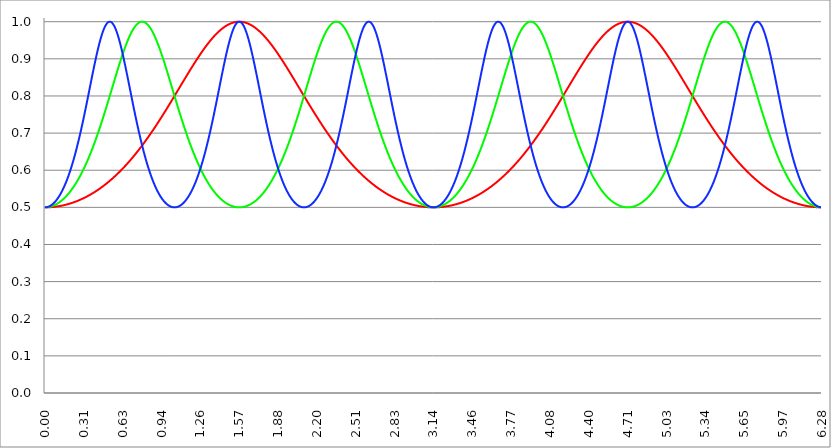
| Category | Series 1 | Series 0 | Series 2 |
|---|---|---|---|
| 0.0 | 0.5 | 0.5 | 0.5 |
| 0.00314159265358979 | 0.5 | 0.5 | 0.5 |
| 0.00628318530717958 | 0.5 | 0.5 | 0.5 |
| 0.00942477796076938 | 0.5 | 0.5 | 0.5 |
| 0.0125663706143592 | 0.5 | 0.5 | 0.5 |
| 0.015707963267949 | 0.5 | 0.5 | 0.501 |
| 0.0188495559215388 | 0.5 | 0.5 | 0.501 |
| 0.0219911485751285 | 0.5 | 0.5 | 0.501 |
| 0.0251327412287183 | 0.5 | 0.501 | 0.501 |
| 0.0282743338823081 | 0.5 | 0.501 | 0.502 |
| 0.0314159265358979 | 0.5 | 0.501 | 0.502 |
| 0.0345575191894877 | 0.5 | 0.501 | 0.503 |
| 0.0376991118430775 | 0.5 | 0.501 | 0.503 |
| 0.0408407044966673 | 0.5 | 0.502 | 0.504 |
| 0.0439822971502571 | 0.5 | 0.502 | 0.504 |
| 0.0471238898038469 | 0.501 | 0.502 | 0.505 |
| 0.0502654824574367 | 0.501 | 0.503 | 0.506 |
| 0.0534070751110265 | 0.501 | 0.503 | 0.506 |
| 0.0565486677646163 | 0.501 | 0.503 | 0.507 |
| 0.059690260418206 | 0.501 | 0.504 | 0.508 |
| 0.0628318530717958 | 0.501 | 0.504 | 0.509 |
| 0.0659734457253856 | 0.501 | 0.504 | 0.51 |
| 0.0691150383789754 | 0.501 | 0.505 | 0.511 |
| 0.0722566310325652 | 0.501 | 0.505 | 0.512 |
| 0.075398223686155 | 0.501 | 0.506 | 0.513 |
| 0.0785398163397448 | 0.502 | 0.506 | 0.514 |
| 0.0816814089933346 | 0.502 | 0.507 | 0.515 |
| 0.0848230016469244 | 0.502 | 0.507 | 0.516 |
| 0.0879645943005142 | 0.502 | 0.508 | 0.518 |
| 0.091106186954104 | 0.502 | 0.508 | 0.519 |
| 0.0942477796076937 | 0.502 | 0.509 | 0.52 |
| 0.0973893722612835 | 0.502 | 0.51 | 0.522 |
| 0.100530964914873 | 0.503 | 0.51 | 0.523 |
| 0.103672557568463 | 0.503 | 0.511 | 0.525 |
| 0.106814150222053 | 0.503 | 0.511 | 0.526 |
| 0.109955742875643 | 0.503 | 0.512 | 0.528 |
| 0.113097335529233 | 0.503 | 0.513 | 0.529 |
| 0.116238928182822 | 0.503 | 0.514 | 0.531 |
| 0.119380520836412 | 0.504 | 0.514 | 0.533 |
| 0.122522113490002 | 0.504 | 0.515 | 0.535 |
| 0.125663706143592 | 0.504 | 0.516 | 0.536 |
| 0.128805298797181 | 0.504 | 0.517 | 0.538 |
| 0.131946891450771 | 0.504 | 0.518 | 0.54 |
| 0.135088484104361 | 0.505 | 0.518 | 0.542 |
| 0.138230076757951 | 0.505 | 0.519 | 0.544 |
| 0.141371669411541 | 0.505 | 0.52 | 0.546 |
| 0.14451326206513 | 0.505 | 0.521 | 0.548 |
| 0.14765485471872 | 0.505 | 0.522 | 0.551 |
| 0.15079644737231 | 0.506 | 0.523 | 0.553 |
| 0.1539380400259 | 0.506 | 0.524 | 0.555 |
| 0.15707963267949 | 0.506 | 0.525 | 0.557 |
| 0.160221225333079 | 0.506 | 0.526 | 0.56 |
| 0.163362817986669 | 0.507 | 0.527 | 0.562 |
| 0.166504410640259 | 0.507 | 0.528 | 0.565 |
| 0.169646003293849 | 0.507 | 0.529 | 0.567 |
| 0.172787595947439 | 0.508 | 0.53 | 0.57 |
| 0.175929188601028 | 0.508 | 0.532 | 0.573 |
| 0.179070781254618 | 0.508 | 0.533 | 0.575 |
| 0.182212373908208 | 0.508 | 0.534 | 0.578 |
| 0.185353966561798 | 0.509 | 0.535 | 0.581 |
| 0.188495559215388 | 0.509 | 0.536 | 0.584 |
| 0.191637151868977 | 0.509 | 0.538 | 0.587 |
| 0.194778744522567 | 0.51 | 0.539 | 0.59 |
| 0.197920337176157 | 0.51 | 0.54 | 0.593 |
| 0.201061929829747 | 0.51 | 0.541 | 0.596 |
| 0.204203522483336 | 0.51 | 0.543 | 0.599 |
| 0.207345115136926 | 0.511 | 0.544 | 0.602 |
| 0.210486707790516 | 0.511 | 0.546 | 0.606 |
| 0.213628300444106 | 0.511 | 0.547 | 0.609 |
| 0.216769893097696 | 0.512 | 0.548 | 0.612 |
| 0.219911485751285 | 0.512 | 0.55 | 0.616 |
| 0.223053078404875 | 0.513 | 0.551 | 0.619 |
| 0.226194671058465 | 0.513 | 0.553 | 0.623 |
| 0.229336263712055 | 0.513 | 0.554 | 0.626 |
| 0.232477856365645 | 0.514 | 0.556 | 0.63 |
| 0.235619449019234 | 0.514 | 0.557 | 0.634 |
| 0.238761041672824 | 0.514 | 0.559 | 0.637 |
| 0.241902634326414 | 0.515 | 0.561 | 0.641 |
| 0.245044226980004 | 0.515 | 0.562 | 0.645 |
| 0.248185819633594 | 0.516 | 0.564 | 0.649 |
| 0.251327412287183 | 0.516 | 0.566 | 0.653 |
| 0.254469004940773 | 0.516 | 0.567 | 0.657 |
| 0.257610597594363 | 0.517 | 0.569 | 0.661 |
| 0.260752190247953 | 0.517 | 0.571 | 0.665 |
| 0.263893782901543 | 0.518 | 0.573 | 0.669 |
| 0.267035375555132 | 0.518 | 0.574 | 0.674 |
| 0.270176968208722 | 0.518 | 0.576 | 0.678 |
| 0.273318560862312 | 0.519 | 0.578 | 0.682 |
| 0.276460153515902 | 0.519 | 0.58 | 0.687 |
| 0.279601746169492 | 0.52 | 0.582 | 0.691 |
| 0.282743338823082 | 0.52 | 0.584 | 0.696 |
| 0.285884931476671 | 0.521 | 0.586 | 0.7 |
| 0.289026524130261 | 0.521 | 0.588 | 0.705 |
| 0.292168116783851 | 0.522 | 0.59 | 0.71 |
| 0.295309709437441 | 0.522 | 0.592 | 0.714 |
| 0.298451302091031 | 0.523 | 0.594 | 0.719 |
| 0.30159289474462 | 0.523 | 0.596 | 0.724 |
| 0.30473448739821 | 0.524 | 0.598 | 0.729 |
| 0.3078760800518 | 0.524 | 0.6 | 0.733 |
| 0.31101767270539 | 0.525 | 0.602 | 0.738 |
| 0.31415926535898 | 0.525 | 0.604 | 0.743 |
| 0.31730085801257 | 0.526 | 0.607 | 0.748 |
| 0.320442450666159 | 0.526 | 0.609 | 0.753 |
| 0.323584043319749 | 0.527 | 0.611 | 0.758 |
| 0.326725635973339 | 0.527 | 0.613 | 0.763 |
| 0.329867228626929 | 0.528 | 0.616 | 0.768 |
| 0.333008821280519 | 0.528 | 0.618 | 0.774 |
| 0.336150413934108 | 0.529 | 0.62 | 0.779 |
| 0.339292006587698 | 0.529 | 0.623 | 0.784 |
| 0.342433599241288 | 0.53 | 0.625 | 0.789 |
| 0.345575191894878 | 0.53 | 0.627 | 0.794 |
| 0.348716784548468 | 0.531 | 0.63 | 0.799 |
| 0.351858377202058 | 0.532 | 0.632 | 0.805 |
| 0.354999969855647 | 0.532 | 0.635 | 0.81 |
| 0.358141562509237 | 0.533 | 0.637 | 0.815 |
| 0.361283155162827 | 0.533 | 0.64 | 0.82 |
| 0.364424747816417 | 0.534 | 0.642 | 0.826 |
| 0.367566340470007 | 0.535 | 0.645 | 0.831 |
| 0.370707933123597 | 0.535 | 0.648 | 0.836 |
| 0.373849525777186 | 0.536 | 0.65 | 0.841 |
| 0.376991118430776 | 0.536 | 0.653 | 0.847 |
| 0.380132711084366 | 0.537 | 0.656 | 0.852 |
| 0.383274303737956 | 0.538 | 0.658 | 0.857 |
| 0.386415896391546 | 0.538 | 0.661 | 0.862 |
| 0.389557489045135 | 0.539 | 0.664 | 0.867 |
| 0.392699081698725 | 0.54 | 0.667 | 0.872 |
| 0.395840674352315 | 0.54 | 0.669 | 0.877 |
| 0.398982267005905 | 0.541 | 0.672 | 0.882 |
| 0.402123859659495 | 0.541 | 0.675 | 0.887 |
| 0.405265452313085 | 0.542 | 0.678 | 0.892 |
| 0.408407044966674 | 0.543 | 0.681 | 0.897 |
| 0.411548637620264 | 0.543 | 0.684 | 0.902 |
| 0.414690230273854 | 0.544 | 0.687 | 0.907 |
| 0.417831822927444 | 0.545 | 0.69 | 0.911 |
| 0.420973415581034 | 0.546 | 0.693 | 0.916 |
| 0.424115008234623 | 0.546 | 0.696 | 0.92 |
| 0.427256600888213 | 0.547 | 0.699 | 0.925 |
| 0.430398193541803 | 0.548 | 0.702 | 0.929 |
| 0.433539786195393 | 0.548 | 0.705 | 0.934 |
| 0.436681378848983 | 0.549 | 0.708 | 0.938 |
| 0.439822971502573 | 0.55 | 0.711 | 0.942 |
| 0.442964564156162 | 0.551 | 0.714 | 0.946 |
| 0.446106156809752 | 0.551 | 0.717 | 0.95 |
| 0.449247749463342 | 0.552 | 0.721 | 0.953 |
| 0.452389342116932 | 0.553 | 0.724 | 0.957 |
| 0.455530934770522 | 0.554 | 0.727 | 0.961 |
| 0.458672527424111 | 0.554 | 0.73 | 0.964 |
| 0.461814120077701 | 0.555 | 0.733 | 0.967 |
| 0.464955712731291 | 0.556 | 0.737 | 0.97 |
| 0.468097305384881 | 0.557 | 0.74 | 0.973 |
| 0.471238898038471 | 0.557 | 0.743 | 0.976 |
| 0.474380490692061 | 0.558 | 0.747 | 0.979 |
| 0.47752208334565 | 0.559 | 0.75 | 0.981 |
| 0.48066367599924 | 0.56 | 0.753 | 0.984 |
| 0.48380526865283 | 0.561 | 0.757 | 0.986 |
| 0.48694686130642 | 0.561 | 0.76 | 0.988 |
| 0.49008845396001 | 0.562 | 0.763 | 0.99 |
| 0.493230046613599 | 0.563 | 0.767 | 0.992 |
| 0.496371639267189 | 0.564 | 0.77 | 0.993 |
| 0.499513231920779 | 0.565 | 0.774 | 0.995 |
| 0.502654824574369 | 0.566 | 0.777 | 0.996 |
| 0.505796417227959 | 0.566 | 0.78 | 0.997 |
| 0.508938009881549 | 0.567 | 0.784 | 0.998 |
| 0.512079602535138 | 0.568 | 0.787 | 0.999 |
| 0.515221195188728 | 0.569 | 0.791 | 0.999 |
| 0.518362787842318 | 0.57 | 0.794 | 1 |
| 0.521504380495908 | 0.571 | 0.798 | 1 |
| 0.524645973149498 | 0.572 | 0.801 | 1 |
| 0.527787565803087 | 0.573 | 0.805 | 1 |
| 0.530929158456677 | 0.574 | 0.808 | 1 |
| 0.534070751110267 | 0.574 | 0.812 | 0.999 |
| 0.537212343763857 | 0.575 | 0.815 | 0.998 |
| 0.540353936417447 | 0.576 | 0.819 | 0.997 |
| 0.543495529071037 | 0.577 | 0.822 | 0.996 |
| 0.546637121724626 | 0.578 | 0.826 | 0.995 |
| 0.549778714378216 | 0.579 | 0.829 | 0.994 |
| 0.552920307031806 | 0.58 | 0.833 | 0.992 |
| 0.556061899685396 | 0.581 | 0.836 | 0.991 |
| 0.559203492338986 | 0.582 | 0.84 | 0.989 |
| 0.562345084992576 | 0.583 | 0.843 | 0.987 |
| 0.565486677646165 | 0.584 | 0.847 | 0.985 |
| 0.568628270299755 | 0.585 | 0.85 | 0.982 |
| 0.571769862953345 | 0.586 | 0.853 | 0.98 |
| 0.574911455606935 | 0.587 | 0.857 | 0.977 |
| 0.578053048260525 | 0.588 | 0.86 | 0.974 |
| 0.581194640914114 | 0.589 | 0.864 | 0.971 |
| 0.584336233567704 | 0.59 | 0.867 | 0.968 |
| 0.587477826221294 | 0.591 | 0.871 | 0.965 |
| 0.590619418874884 | 0.592 | 0.874 | 0.962 |
| 0.593761011528474 | 0.593 | 0.877 | 0.958 |
| 0.596902604182064 | 0.594 | 0.881 | 0.955 |
| 0.600044196835653 | 0.595 | 0.884 | 0.951 |
| 0.603185789489243 | 0.596 | 0.887 | 0.947 |
| 0.606327382142833 | 0.597 | 0.891 | 0.943 |
| 0.609468974796423 | 0.598 | 0.894 | 0.939 |
| 0.612610567450013 | 0.599 | 0.897 | 0.935 |
| 0.615752160103602 | 0.6 | 0.9 | 0.931 |
| 0.618893752757192 | 0.601 | 0.903 | 0.926 |
| 0.622035345410782 | 0.602 | 0.907 | 0.922 |
| 0.625176938064372 | 0.603 | 0.91 | 0.917 |
| 0.628318530717962 | 0.604 | 0.913 | 0.913 |
| 0.631460123371551 | 0.606 | 0.916 | 0.908 |
| 0.634601716025141 | 0.607 | 0.919 | 0.903 |
| 0.637743308678731 | 0.608 | 0.922 | 0.899 |
| 0.640884901332321 | 0.609 | 0.925 | 0.894 |
| 0.644026493985911 | 0.61 | 0.928 | 0.889 |
| 0.647168086639501 | 0.611 | 0.931 | 0.884 |
| 0.65030967929309 | 0.612 | 0.934 | 0.879 |
| 0.65345127194668 | 0.613 | 0.936 | 0.874 |
| 0.65659286460027 | 0.614 | 0.939 | 0.869 |
| 0.65973445725386 | 0.616 | 0.942 | 0.864 |
| 0.66287604990745 | 0.617 | 0.944 | 0.859 |
| 0.666017642561039 | 0.618 | 0.947 | 0.853 |
| 0.669159235214629 | 0.619 | 0.95 | 0.848 |
| 0.672300827868219 | 0.62 | 0.952 | 0.843 |
| 0.675442420521809 | 0.621 | 0.955 | 0.838 |
| 0.678584013175399 | 0.623 | 0.957 | 0.833 |
| 0.681725605828989 | 0.624 | 0.959 | 0.827 |
| 0.684867198482578 | 0.625 | 0.962 | 0.822 |
| 0.688008791136168 | 0.626 | 0.964 | 0.817 |
| 0.691150383789758 | 0.627 | 0.966 | 0.812 |
| 0.694291976443348 | 0.629 | 0.968 | 0.806 |
| 0.697433569096938 | 0.63 | 0.97 | 0.801 |
| 0.700575161750528 | 0.631 | 0.972 | 0.796 |
| 0.703716754404117 | 0.632 | 0.974 | 0.791 |
| 0.706858347057707 | 0.634 | 0.976 | 0.786 |
| 0.709999939711297 | 0.635 | 0.978 | 0.78 |
| 0.713141532364887 | 0.636 | 0.98 | 0.775 |
| 0.716283125018477 | 0.637 | 0.981 | 0.77 |
| 0.719424717672066 | 0.639 | 0.983 | 0.765 |
| 0.722566310325656 | 0.64 | 0.985 | 0.76 |
| 0.725707902979246 | 0.641 | 0.986 | 0.755 |
| 0.728849495632836 | 0.642 | 0.987 | 0.75 |
| 0.731991088286426 | 0.644 | 0.989 | 0.745 |
| 0.735132680940016 | 0.645 | 0.99 | 0.74 |
| 0.738274273593605 | 0.646 | 0.991 | 0.735 |
| 0.741415866247195 | 0.648 | 0.992 | 0.73 |
| 0.744557458900785 | 0.649 | 0.993 | 0.725 |
| 0.747699051554375 | 0.65 | 0.994 | 0.721 |
| 0.750840644207965 | 0.652 | 0.995 | 0.716 |
| 0.753982236861554 | 0.653 | 0.996 | 0.711 |
| 0.757123829515144 | 0.654 | 0.997 | 0.706 |
| 0.760265422168734 | 0.656 | 0.997 | 0.702 |
| 0.763407014822324 | 0.657 | 0.998 | 0.697 |
| 0.766548607475914 | 0.658 | 0.999 | 0.693 |
| 0.769690200129504 | 0.66 | 0.999 | 0.688 |
| 0.772831792783093 | 0.661 | 0.999 | 0.684 |
| 0.775973385436683 | 0.663 | 1 | 0.679 |
| 0.779114978090273 | 0.664 | 1 | 0.675 |
| 0.782256570743863 | 0.665 | 1 | 0.671 |
| 0.785398163397453 | 0.667 | 1 | 0.667 |
| 0.788539756051042 | 0.668 | 1 | 0.663 |
| 0.791681348704632 | 0.669 | 1 | 0.658 |
| 0.794822941358222 | 0.671 | 1 | 0.654 |
| 0.797964534011812 | 0.672 | 0.999 | 0.65 |
| 0.801106126665402 | 0.674 | 0.999 | 0.646 |
| 0.804247719318992 | 0.675 | 0.999 | 0.642 |
| 0.807389311972581 | 0.677 | 0.998 | 0.639 |
| 0.810530904626171 | 0.678 | 0.997 | 0.635 |
| 0.813672497279761 | 0.679 | 0.997 | 0.631 |
| 0.816814089933351 | 0.681 | 0.996 | 0.627 |
| 0.819955682586941 | 0.682 | 0.995 | 0.624 |
| 0.823097275240531 | 0.684 | 0.994 | 0.62 |
| 0.82623886789412 | 0.685 | 0.993 | 0.617 |
| 0.82938046054771 | 0.687 | 0.992 | 0.613 |
| 0.8325220532013 | 0.688 | 0.991 | 0.61 |
| 0.83566364585489 | 0.69 | 0.99 | 0.607 |
| 0.83880523850848 | 0.691 | 0.989 | 0.603 |
| 0.841946831162069 | 0.693 | 0.987 | 0.6 |
| 0.845088423815659 | 0.694 | 0.986 | 0.597 |
| 0.848230016469249 | 0.696 | 0.985 | 0.594 |
| 0.851371609122839 | 0.697 | 0.983 | 0.591 |
| 0.854513201776429 | 0.699 | 0.981 | 0.588 |
| 0.857654794430019 | 0.7 | 0.98 | 0.585 |
| 0.860796387083608 | 0.702 | 0.978 | 0.582 |
| 0.863937979737198 | 0.703 | 0.976 | 0.579 |
| 0.867079572390788 | 0.705 | 0.974 | 0.576 |
| 0.870221165044378 | 0.706 | 0.972 | 0.574 |
| 0.873362757697968 | 0.708 | 0.97 | 0.571 |
| 0.876504350351557 | 0.71 | 0.968 | 0.568 |
| 0.879645943005147 | 0.711 | 0.966 | 0.566 |
| 0.882787535658737 | 0.713 | 0.964 | 0.563 |
| 0.885929128312327 | 0.714 | 0.962 | 0.561 |
| 0.889070720965917 | 0.716 | 0.959 | 0.558 |
| 0.892212313619507 | 0.717 | 0.957 | 0.556 |
| 0.895353906273096 | 0.719 | 0.955 | 0.554 |
| 0.898495498926686 | 0.721 | 0.952 | 0.551 |
| 0.901637091580276 | 0.722 | 0.95 | 0.549 |
| 0.904778684233866 | 0.724 | 0.947 | 0.547 |
| 0.907920276887456 | 0.725 | 0.944 | 0.545 |
| 0.911061869541045 | 0.727 | 0.942 | 0.543 |
| 0.914203462194635 | 0.729 | 0.939 | 0.541 |
| 0.917345054848225 | 0.73 | 0.936 | 0.539 |
| 0.920486647501815 | 0.732 | 0.934 | 0.537 |
| 0.923628240155405 | 0.733 | 0.931 | 0.535 |
| 0.926769832808995 | 0.735 | 0.928 | 0.533 |
| 0.929911425462584 | 0.737 | 0.925 | 0.532 |
| 0.933053018116174 | 0.738 | 0.922 | 0.53 |
| 0.936194610769764 | 0.74 | 0.919 | 0.528 |
| 0.939336203423354 | 0.742 | 0.916 | 0.527 |
| 0.942477796076944 | 0.743 | 0.913 | 0.525 |
| 0.945619388730533 | 0.745 | 0.91 | 0.524 |
| 0.948760981384123 | 0.747 | 0.907 | 0.522 |
| 0.951902574037713 | 0.748 | 0.903 | 0.521 |
| 0.955044166691303 | 0.75 | 0.9 | 0.519 |
| 0.958185759344893 | 0.752 | 0.897 | 0.518 |
| 0.961327351998483 | 0.753 | 0.894 | 0.517 |
| 0.964468944652072 | 0.755 | 0.891 | 0.516 |
| 0.967610537305662 | 0.757 | 0.887 | 0.514 |
| 0.970752129959252 | 0.758 | 0.884 | 0.513 |
| 0.973893722612842 | 0.76 | 0.881 | 0.512 |
| 0.977035315266432 | 0.762 | 0.877 | 0.511 |
| 0.980176907920022 | 0.763 | 0.874 | 0.51 |
| 0.983318500573611 | 0.765 | 0.871 | 0.509 |
| 0.986460093227201 | 0.767 | 0.867 | 0.508 |
| 0.989601685880791 | 0.768 | 0.864 | 0.508 |
| 0.992743278534381 | 0.77 | 0.86 | 0.507 |
| 0.995884871187971 | 0.772 | 0.857 | 0.506 |
| 0.99902646384156 | 0.774 | 0.853 | 0.505 |
| 1.00216805649515 | 0.775 | 0.85 | 0.505 |
| 1.00530964914874 | 0.777 | 0.847 | 0.504 |
| 1.00845124180233 | 0.779 | 0.843 | 0.503 |
| 1.01159283445592 | 0.78 | 0.84 | 0.503 |
| 1.01473442710951 | 0.782 | 0.836 | 0.502 |
| 1.017876019763099 | 0.784 | 0.833 | 0.502 |
| 1.021017612416689 | 0.786 | 0.829 | 0.502 |
| 1.02415920507028 | 0.787 | 0.826 | 0.501 |
| 1.027300797723869 | 0.789 | 0.822 | 0.501 |
| 1.030442390377459 | 0.791 | 0.819 | 0.501 |
| 1.033583983031048 | 0.792 | 0.815 | 0.5 |
| 1.036725575684638 | 0.794 | 0.812 | 0.5 |
| 1.039867168338228 | 0.796 | 0.808 | 0.5 |
| 1.043008760991818 | 0.798 | 0.805 | 0.5 |
| 1.046150353645408 | 0.799 | 0.801 | 0.5 |
| 1.049291946298998 | 0.801 | 0.798 | 0.5 |
| 1.052433538952587 | 0.803 | 0.794 | 0.5 |
| 1.055575131606177 | 0.805 | 0.791 | 0.5 |
| 1.058716724259767 | 0.806 | 0.787 | 0.5 |
| 1.061858316913357 | 0.808 | 0.784 | 0.5 |
| 1.064999909566947 | 0.81 | 0.78 | 0.501 |
| 1.068141502220536 | 0.812 | 0.777 | 0.501 |
| 1.071283094874126 | 0.813 | 0.774 | 0.501 |
| 1.074424687527716 | 0.815 | 0.77 | 0.502 |
| 1.077566280181306 | 0.817 | 0.767 | 0.502 |
| 1.080707872834896 | 0.819 | 0.763 | 0.503 |
| 1.083849465488486 | 0.82 | 0.76 | 0.503 |
| 1.086991058142075 | 0.822 | 0.757 | 0.504 |
| 1.090132650795665 | 0.824 | 0.753 | 0.504 |
| 1.093274243449255 | 0.826 | 0.75 | 0.505 |
| 1.096415836102845 | 0.827 | 0.747 | 0.505 |
| 1.099557428756435 | 0.829 | 0.743 | 0.506 |
| 1.102699021410025 | 0.831 | 0.74 | 0.507 |
| 1.105840614063614 | 0.833 | 0.737 | 0.508 |
| 1.108982206717204 | 0.834 | 0.733 | 0.509 |
| 1.112123799370794 | 0.836 | 0.73 | 0.51 |
| 1.115265392024384 | 0.838 | 0.727 | 0.51 |
| 1.118406984677974 | 0.84 | 0.724 | 0.511 |
| 1.121548577331563 | 0.841 | 0.721 | 0.513 |
| 1.124690169985153 | 0.843 | 0.717 | 0.514 |
| 1.127831762638743 | 0.845 | 0.714 | 0.515 |
| 1.130973355292333 | 0.847 | 0.711 | 0.516 |
| 1.134114947945923 | 0.848 | 0.708 | 0.517 |
| 1.137256540599513 | 0.85 | 0.705 | 0.518 |
| 1.140398133253102 | 0.852 | 0.702 | 0.52 |
| 1.143539725906692 | 0.853 | 0.699 | 0.521 |
| 1.146681318560282 | 0.855 | 0.696 | 0.523 |
| 1.149822911213872 | 0.857 | 0.693 | 0.524 |
| 1.152964503867462 | 0.859 | 0.69 | 0.526 |
| 1.156106096521051 | 0.86 | 0.687 | 0.527 |
| 1.159247689174641 | 0.862 | 0.684 | 0.529 |
| 1.162389281828231 | 0.864 | 0.681 | 0.53 |
| 1.165530874481821 | 0.865 | 0.678 | 0.532 |
| 1.168672467135411 | 0.867 | 0.675 | 0.534 |
| 1.171814059789001 | 0.869 | 0.672 | 0.536 |
| 1.17495565244259 | 0.871 | 0.669 | 0.538 |
| 1.17809724509618 | 0.872 | 0.667 | 0.54 |
| 1.18123883774977 | 0.874 | 0.664 | 0.541 |
| 1.18438043040336 | 0.876 | 0.661 | 0.543 |
| 1.18752202305695 | 0.877 | 0.658 | 0.546 |
| 1.190663615710539 | 0.879 | 0.656 | 0.548 |
| 1.193805208364129 | 0.881 | 0.653 | 0.55 |
| 1.19694680101772 | 0.882 | 0.65 | 0.552 |
| 1.200088393671309 | 0.884 | 0.648 | 0.554 |
| 1.203229986324899 | 0.886 | 0.645 | 0.557 |
| 1.206371578978489 | 0.887 | 0.642 | 0.559 |
| 1.209513171632078 | 0.889 | 0.64 | 0.561 |
| 1.212654764285668 | 0.891 | 0.637 | 0.564 |
| 1.215796356939258 | 0.892 | 0.635 | 0.566 |
| 1.218937949592848 | 0.894 | 0.632 | 0.569 |
| 1.222079542246438 | 0.895 | 0.63 | 0.572 |
| 1.225221134900027 | 0.897 | 0.627 | 0.574 |
| 1.228362727553617 | 0.899 | 0.625 | 0.577 |
| 1.231504320207207 | 0.9 | 0.623 | 0.58 |
| 1.234645912860797 | 0.902 | 0.62 | 0.583 |
| 1.237787505514387 | 0.903 | 0.618 | 0.586 |
| 1.240929098167977 | 0.905 | 0.616 | 0.589 |
| 1.244070690821566 | 0.907 | 0.613 | 0.592 |
| 1.247212283475156 | 0.908 | 0.611 | 0.595 |
| 1.250353876128746 | 0.91 | 0.609 | 0.598 |
| 1.253495468782336 | 0.911 | 0.607 | 0.601 |
| 1.256637061435926 | 0.913 | 0.604 | 0.604 |
| 1.259778654089515 | 0.914 | 0.602 | 0.608 |
| 1.262920246743105 | 0.916 | 0.6 | 0.611 |
| 1.266061839396695 | 0.917 | 0.598 | 0.614 |
| 1.269203432050285 | 0.919 | 0.596 | 0.618 |
| 1.272345024703875 | 0.92 | 0.594 | 0.621 |
| 1.275486617357465 | 0.922 | 0.592 | 0.625 |
| 1.278628210011054 | 0.923 | 0.59 | 0.629 |
| 1.281769802664644 | 0.925 | 0.588 | 0.632 |
| 1.284911395318234 | 0.926 | 0.586 | 0.636 |
| 1.288052987971824 | 0.928 | 0.584 | 0.64 |
| 1.291194580625414 | 0.929 | 0.582 | 0.644 |
| 1.294336173279003 | 0.931 | 0.58 | 0.648 |
| 1.297477765932593 | 0.932 | 0.578 | 0.652 |
| 1.300619358586183 | 0.934 | 0.576 | 0.656 |
| 1.303760951239773 | 0.935 | 0.574 | 0.66 |
| 1.306902543893363 | 0.936 | 0.573 | 0.664 |
| 1.310044136546953 | 0.938 | 0.571 | 0.668 |
| 1.313185729200542 | 0.939 | 0.569 | 0.672 |
| 1.316327321854132 | 0.94 | 0.567 | 0.677 |
| 1.319468914507722 | 0.942 | 0.566 | 0.681 |
| 1.322610507161312 | 0.943 | 0.564 | 0.685 |
| 1.325752099814902 | 0.944 | 0.562 | 0.69 |
| 1.328893692468491 | 0.946 | 0.561 | 0.694 |
| 1.332035285122081 | 0.947 | 0.559 | 0.699 |
| 1.335176877775671 | 0.948 | 0.557 | 0.703 |
| 1.338318470429261 | 0.95 | 0.556 | 0.708 |
| 1.341460063082851 | 0.951 | 0.554 | 0.713 |
| 1.344601655736441 | 0.952 | 0.553 | 0.717 |
| 1.34774324839003 | 0.953 | 0.551 | 0.722 |
| 1.35088484104362 | 0.955 | 0.55 | 0.727 |
| 1.35402643369721 | 0.956 | 0.548 | 0.732 |
| 1.3571680263508 | 0.957 | 0.547 | 0.737 |
| 1.36030961900439 | 0.958 | 0.546 | 0.742 |
| 1.363451211657979 | 0.959 | 0.544 | 0.747 |
| 1.36659280431157 | 0.961 | 0.543 | 0.752 |
| 1.369734396965159 | 0.962 | 0.541 | 0.757 |
| 1.372875989618749 | 0.963 | 0.54 | 0.762 |
| 1.376017582272339 | 0.964 | 0.539 | 0.767 |
| 1.379159174925929 | 0.965 | 0.538 | 0.772 |
| 1.382300767579518 | 0.966 | 0.536 | 0.777 |
| 1.385442360233108 | 0.967 | 0.535 | 0.782 |
| 1.388583952886698 | 0.968 | 0.534 | 0.787 |
| 1.391725545540288 | 0.969 | 0.533 | 0.792 |
| 1.394867138193878 | 0.97 | 0.532 | 0.798 |
| 1.398008730847468 | 0.971 | 0.53 | 0.803 |
| 1.401150323501057 | 0.972 | 0.529 | 0.808 |
| 1.404291916154647 | 0.973 | 0.528 | 0.813 |
| 1.407433508808237 | 0.974 | 0.527 | 0.819 |
| 1.410575101461827 | 0.975 | 0.526 | 0.824 |
| 1.413716694115417 | 0.976 | 0.525 | 0.829 |
| 1.416858286769006 | 0.977 | 0.524 | 0.834 |
| 1.419999879422596 | 0.978 | 0.523 | 0.84 |
| 1.423141472076186 | 0.979 | 0.522 | 0.845 |
| 1.426283064729776 | 0.98 | 0.521 | 0.85 |
| 1.429424657383366 | 0.981 | 0.52 | 0.855 |
| 1.432566250036956 | 0.981 | 0.519 | 0.86 |
| 1.435707842690545 | 0.982 | 0.518 | 0.865 |
| 1.438849435344135 | 0.983 | 0.518 | 0.871 |
| 1.441991027997725 | 0.984 | 0.517 | 0.876 |
| 1.445132620651315 | 0.985 | 0.516 | 0.881 |
| 1.448274213304905 | 0.985 | 0.515 | 0.886 |
| 1.451415805958494 | 0.986 | 0.514 | 0.891 |
| 1.454557398612084 | 0.987 | 0.514 | 0.895 |
| 1.457698991265674 | 0.987 | 0.513 | 0.9 |
| 1.460840583919264 | 0.988 | 0.512 | 0.905 |
| 1.463982176572854 | 0.989 | 0.511 | 0.91 |
| 1.467123769226444 | 0.989 | 0.511 | 0.914 |
| 1.470265361880033 | 0.99 | 0.51 | 0.919 |
| 1.473406954533623 | 0.991 | 0.51 | 0.923 |
| 1.476548547187213 | 0.991 | 0.509 | 0.928 |
| 1.479690139840803 | 0.992 | 0.508 | 0.932 |
| 1.482831732494393 | 0.992 | 0.508 | 0.936 |
| 1.485973325147982 | 0.993 | 0.507 | 0.94 |
| 1.489114917801572 | 0.993 | 0.507 | 0.944 |
| 1.492256510455162 | 0.994 | 0.506 | 0.948 |
| 1.495398103108752 | 0.994 | 0.506 | 0.952 |
| 1.498539695762342 | 0.995 | 0.505 | 0.956 |
| 1.501681288415932 | 0.995 | 0.505 | 0.959 |
| 1.504822881069521 | 0.996 | 0.504 | 0.963 |
| 1.507964473723111 | 0.996 | 0.504 | 0.966 |
| 1.511106066376701 | 0.996 | 0.504 | 0.969 |
| 1.514247659030291 | 0.997 | 0.503 | 0.972 |
| 1.517389251683881 | 0.997 | 0.503 | 0.975 |
| 1.520530844337471 | 0.997 | 0.503 | 0.978 |
| 1.52367243699106 | 0.998 | 0.502 | 0.981 |
| 1.52681402964465 | 0.998 | 0.502 | 0.983 |
| 1.52995562229824 | 0.998 | 0.502 | 0.985 |
| 1.53309721495183 | 0.999 | 0.501 | 0.987 |
| 1.53623880760542 | 0.999 | 0.501 | 0.989 |
| 1.539380400259009 | 0.999 | 0.501 | 0.991 |
| 1.542521992912599 | 0.999 | 0.501 | 0.993 |
| 1.545663585566189 | 0.999 | 0.501 | 0.994 |
| 1.548805178219779 | 1 | 0.5 | 0.996 |
| 1.551946770873369 | 1 | 0.5 | 0.997 |
| 1.555088363526959 | 1 | 0.5 | 0.998 |
| 1.558229956180548 | 1 | 0.5 | 0.999 |
| 1.561371548834138 | 1 | 0.5 | 0.999 |
| 1.564513141487728 | 1 | 0.5 | 1 |
| 1.567654734141318 | 1 | 0.5 | 1 |
| 1.570796326794908 | 1 | 0.5 | 1 |
| 1.573937919448497 | 1 | 0.5 | 1 |
| 1.577079512102087 | 1 | 0.5 | 1 |
| 1.580221104755677 | 1 | 0.5 | 0.999 |
| 1.583362697409267 | 1 | 0.5 | 0.999 |
| 1.586504290062857 | 1 | 0.5 | 0.998 |
| 1.589645882716447 | 1 | 0.5 | 0.997 |
| 1.592787475370036 | 1 | 0.5 | 0.996 |
| 1.595929068023626 | 0.999 | 0.501 | 0.994 |
| 1.599070660677216 | 0.999 | 0.501 | 0.993 |
| 1.602212253330806 | 0.999 | 0.501 | 0.991 |
| 1.605353845984396 | 0.999 | 0.501 | 0.989 |
| 1.608495438637985 | 0.999 | 0.501 | 0.987 |
| 1.611637031291575 | 0.998 | 0.502 | 0.985 |
| 1.614778623945165 | 0.998 | 0.502 | 0.983 |
| 1.617920216598755 | 0.998 | 0.502 | 0.981 |
| 1.621061809252345 | 0.997 | 0.503 | 0.978 |
| 1.624203401905935 | 0.997 | 0.503 | 0.975 |
| 1.627344994559524 | 0.997 | 0.503 | 0.972 |
| 1.630486587213114 | 0.996 | 0.504 | 0.969 |
| 1.633628179866704 | 0.996 | 0.504 | 0.966 |
| 1.636769772520294 | 0.996 | 0.504 | 0.963 |
| 1.639911365173884 | 0.995 | 0.505 | 0.959 |
| 1.643052957827473 | 0.995 | 0.505 | 0.956 |
| 1.646194550481063 | 0.994 | 0.506 | 0.952 |
| 1.649336143134653 | 0.994 | 0.506 | 0.948 |
| 1.652477735788243 | 0.993 | 0.507 | 0.944 |
| 1.655619328441833 | 0.993 | 0.507 | 0.94 |
| 1.658760921095423 | 0.992 | 0.508 | 0.936 |
| 1.661902513749012 | 0.992 | 0.508 | 0.932 |
| 1.665044106402602 | 0.991 | 0.509 | 0.928 |
| 1.668185699056192 | 0.991 | 0.51 | 0.923 |
| 1.671327291709782 | 0.99 | 0.51 | 0.919 |
| 1.674468884363372 | 0.989 | 0.511 | 0.914 |
| 1.677610477016961 | 0.989 | 0.511 | 0.91 |
| 1.680752069670551 | 0.988 | 0.512 | 0.905 |
| 1.683893662324141 | 0.987 | 0.513 | 0.9 |
| 1.687035254977731 | 0.987 | 0.514 | 0.895 |
| 1.690176847631321 | 0.986 | 0.514 | 0.891 |
| 1.693318440284911 | 0.985 | 0.515 | 0.886 |
| 1.6964600329385 | 0.985 | 0.516 | 0.881 |
| 1.69960162559209 | 0.984 | 0.517 | 0.876 |
| 1.70274321824568 | 0.983 | 0.518 | 0.871 |
| 1.70588481089927 | 0.982 | 0.518 | 0.865 |
| 1.70902640355286 | 0.981 | 0.519 | 0.86 |
| 1.712167996206449 | 0.981 | 0.52 | 0.855 |
| 1.715309588860039 | 0.98 | 0.521 | 0.85 |
| 1.71845118151363 | 0.979 | 0.522 | 0.845 |
| 1.721592774167219 | 0.978 | 0.523 | 0.84 |
| 1.724734366820809 | 0.977 | 0.524 | 0.834 |
| 1.727875959474399 | 0.976 | 0.525 | 0.829 |
| 1.731017552127988 | 0.975 | 0.526 | 0.824 |
| 1.734159144781578 | 0.974 | 0.527 | 0.819 |
| 1.737300737435168 | 0.973 | 0.528 | 0.813 |
| 1.740442330088758 | 0.972 | 0.529 | 0.808 |
| 1.743583922742348 | 0.971 | 0.53 | 0.803 |
| 1.746725515395937 | 0.97 | 0.532 | 0.798 |
| 1.749867108049527 | 0.969 | 0.533 | 0.792 |
| 1.753008700703117 | 0.968 | 0.534 | 0.787 |
| 1.756150293356707 | 0.967 | 0.535 | 0.782 |
| 1.759291886010297 | 0.966 | 0.536 | 0.777 |
| 1.762433478663887 | 0.965 | 0.538 | 0.772 |
| 1.765575071317476 | 0.964 | 0.539 | 0.767 |
| 1.768716663971066 | 0.963 | 0.54 | 0.762 |
| 1.771858256624656 | 0.962 | 0.541 | 0.757 |
| 1.774999849278246 | 0.961 | 0.543 | 0.752 |
| 1.778141441931836 | 0.959 | 0.544 | 0.747 |
| 1.781283034585426 | 0.958 | 0.546 | 0.742 |
| 1.784424627239015 | 0.957 | 0.547 | 0.737 |
| 1.787566219892605 | 0.956 | 0.548 | 0.732 |
| 1.790707812546195 | 0.955 | 0.55 | 0.727 |
| 1.793849405199785 | 0.953 | 0.551 | 0.722 |
| 1.796990997853375 | 0.952 | 0.553 | 0.717 |
| 1.800132590506964 | 0.951 | 0.554 | 0.713 |
| 1.803274183160554 | 0.95 | 0.556 | 0.708 |
| 1.806415775814144 | 0.948 | 0.557 | 0.703 |
| 1.809557368467734 | 0.947 | 0.559 | 0.699 |
| 1.812698961121324 | 0.946 | 0.561 | 0.694 |
| 1.815840553774914 | 0.944 | 0.562 | 0.69 |
| 1.818982146428503 | 0.943 | 0.564 | 0.685 |
| 1.822123739082093 | 0.942 | 0.566 | 0.681 |
| 1.825265331735683 | 0.94 | 0.567 | 0.677 |
| 1.828406924389273 | 0.939 | 0.569 | 0.672 |
| 1.831548517042863 | 0.938 | 0.571 | 0.668 |
| 1.834690109696452 | 0.936 | 0.573 | 0.664 |
| 1.837831702350042 | 0.935 | 0.574 | 0.66 |
| 1.840973295003632 | 0.934 | 0.576 | 0.656 |
| 1.844114887657222 | 0.932 | 0.578 | 0.652 |
| 1.847256480310812 | 0.931 | 0.58 | 0.648 |
| 1.850398072964402 | 0.929 | 0.582 | 0.644 |
| 1.853539665617991 | 0.928 | 0.584 | 0.64 |
| 1.856681258271581 | 0.926 | 0.586 | 0.636 |
| 1.859822850925171 | 0.925 | 0.588 | 0.632 |
| 1.862964443578761 | 0.923 | 0.59 | 0.629 |
| 1.866106036232351 | 0.922 | 0.592 | 0.625 |
| 1.86924762888594 | 0.92 | 0.594 | 0.621 |
| 1.87238922153953 | 0.919 | 0.596 | 0.618 |
| 1.87553081419312 | 0.917 | 0.598 | 0.614 |
| 1.87867240684671 | 0.916 | 0.6 | 0.611 |
| 1.8818139995003 | 0.914 | 0.602 | 0.608 |
| 1.88495559215389 | 0.913 | 0.604 | 0.604 |
| 1.888097184807479 | 0.911 | 0.607 | 0.601 |
| 1.891238777461069 | 0.91 | 0.609 | 0.598 |
| 1.89438037011466 | 0.908 | 0.611 | 0.595 |
| 1.897521962768249 | 0.907 | 0.613 | 0.592 |
| 1.900663555421839 | 0.905 | 0.616 | 0.589 |
| 1.903805148075429 | 0.903 | 0.618 | 0.586 |
| 1.906946740729018 | 0.902 | 0.62 | 0.583 |
| 1.910088333382608 | 0.9 | 0.623 | 0.58 |
| 1.913229926036198 | 0.899 | 0.625 | 0.577 |
| 1.916371518689788 | 0.897 | 0.627 | 0.574 |
| 1.919513111343378 | 0.895 | 0.63 | 0.572 |
| 1.922654703996967 | 0.894 | 0.632 | 0.569 |
| 1.925796296650557 | 0.892 | 0.635 | 0.566 |
| 1.928937889304147 | 0.891 | 0.637 | 0.564 |
| 1.932079481957737 | 0.889 | 0.64 | 0.561 |
| 1.935221074611327 | 0.887 | 0.642 | 0.559 |
| 1.938362667264917 | 0.886 | 0.645 | 0.557 |
| 1.941504259918506 | 0.884 | 0.648 | 0.554 |
| 1.944645852572096 | 0.882 | 0.65 | 0.552 |
| 1.947787445225686 | 0.881 | 0.653 | 0.55 |
| 1.950929037879276 | 0.879 | 0.656 | 0.548 |
| 1.954070630532866 | 0.877 | 0.658 | 0.546 |
| 1.957212223186455 | 0.876 | 0.661 | 0.543 |
| 1.960353815840045 | 0.874 | 0.664 | 0.541 |
| 1.963495408493635 | 0.872 | 0.667 | 0.54 |
| 1.966637001147225 | 0.871 | 0.669 | 0.538 |
| 1.969778593800815 | 0.869 | 0.672 | 0.536 |
| 1.972920186454405 | 0.867 | 0.675 | 0.534 |
| 1.976061779107994 | 0.865 | 0.678 | 0.532 |
| 1.979203371761584 | 0.864 | 0.681 | 0.53 |
| 1.982344964415174 | 0.862 | 0.684 | 0.529 |
| 1.985486557068764 | 0.86 | 0.687 | 0.527 |
| 1.988628149722354 | 0.859 | 0.69 | 0.526 |
| 1.991769742375943 | 0.857 | 0.693 | 0.524 |
| 1.994911335029533 | 0.855 | 0.696 | 0.523 |
| 1.998052927683123 | 0.853 | 0.699 | 0.521 |
| 2.001194520336712 | 0.852 | 0.702 | 0.52 |
| 2.004336112990302 | 0.85 | 0.705 | 0.518 |
| 2.007477705643892 | 0.848 | 0.708 | 0.517 |
| 2.010619298297482 | 0.847 | 0.711 | 0.516 |
| 2.013760890951071 | 0.845 | 0.714 | 0.515 |
| 2.016902483604661 | 0.843 | 0.717 | 0.514 |
| 2.02004407625825 | 0.841 | 0.721 | 0.513 |
| 2.02318566891184 | 0.84 | 0.724 | 0.511 |
| 2.02632726156543 | 0.838 | 0.727 | 0.51 |
| 2.029468854219019 | 0.836 | 0.73 | 0.51 |
| 2.032610446872609 | 0.834 | 0.733 | 0.509 |
| 2.035752039526198 | 0.833 | 0.737 | 0.508 |
| 2.038893632179788 | 0.831 | 0.74 | 0.507 |
| 2.042035224833378 | 0.829 | 0.743 | 0.506 |
| 2.045176817486967 | 0.827 | 0.747 | 0.505 |
| 2.048318410140557 | 0.826 | 0.75 | 0.505 |
| 2.051460002794146 | 0.824 | 0.753 | 0.504 |
| 2.054601595447736 | 0.822 | 0.757 | 0.504 |
| 2.057743188101325 | 0.82 | 0.76 | 0.503 |
| 2.060884780754915 | 0.819 | 0.763 | 0.503 |
| 2.064026373408505 | 0.817 | 0.767 | 0.502 |
| 2.067167966062094 | 0.815 | 0.77 | 0.502 |
| 2.070309558715684 | 0.813 | 0.774 | 0.501 |
| 2.073451151369273 | 0.812 | 0.777 | 0.501 |
| 2.076592744022863 | 0.81 | 0.78 | 0.501 |
| 2.079734336676452 | 0.808 | 0.784 | 0.5 |
| 2.082875929330042 | 0.806 | 0.787 | 0.5 |
| 2.086017521983632 | 0.805 | 0.791 | 0.5 |
| 2.089159114637221 | 0.803 | 0.794 | 0.5 |
| 2.092300707290811 | 0.801 | 0.798 | 0.5 |
| 2.095442299944401 | 0.799 | 0.801 | 0.5 |
| 2.09858389259799 | 0.798 | 0.805 | 0.5 |
| 2.10172548525158 | 0.796 | 0.808 | 0.5 |
| 2.104867077905169 | 0.794 | 0.812 | 0.5 |
| 2.108008670558759 | 0.792 | 0.815 | 0.5 |
| 2.111150263212349 | 0.791 | 0.819 | 0.501 |
| 2.114291855865938 | 0.789 | 0.822 | 0.501 |
| 2.117433448519528 | 0.787 | 0.826 | 0.501 |
| 2.120575041173117 | 0.786 | 0.829 | 0.502 |
| 2.123716633826707 | 0.784 | 0.833 | 0.502 |
| 2.126858226480297 | 0.782 | 0.836 | 0.502 |
| 2.129999819133886 | 0.78 | 0.84 | 0.503 |
| 2.133141411787476 | 0.779 | 0.843 | 0.503 |
| 2.136283004441065 | 0.777 | 0.847 | 0.504 |
| 2.139424597094655 | 0.775 | 0.85 | 0.505 |
| 2.142566189748245 | 0.774 | 0.853 | 0.505 |
| 2.145707782401834 | 0.772 | 0.857 | 0.506 |
| 2.148849375055424 | 0.77 | 0.86 | 0.507 |
| 2.151990967709013 | 0.768 | 0.864 | 0.508 |
| 2.155132560362603 | 0.767 | 0.867 | 0.508 |
| 2.158274153016193 | 0.765 | 0.871 | 0.509 |
| 2.161415745669782 | 0.763 | 0.874 | 0.51 |
| 2.164557338323372 | 0.762 | 0.877 | 0.511 |
| 2.167698930976961 | 0.76 | 0.881 | 0.512 |
| 2.170840523630551 | 0.758 | 0.884 | 0.513 |
| 2.173982116284141 | 0.757 | 0.887 | 0.514 |
| 2.17712370893773 | 0.755 | 0.891 | 0.516 |
| 2.18026530159132 | 0.753 | 0.894 | 0.517 |
| 2.183406894244909 | 0.752 | 0.897 | 0.518 |
| 2.186548486898499 | 0.75 | 0.9 | 0.519 |
| 2.189690079552089 | 0.748 | 0.903 | 0.521 |
| 2.192831672205678 | 0.747 | 0.907 | 0.522 |
| 2.195973264859268 | 0.745 | 0.91 | 0.524 |
| 2.199114857512857 | 0.743 | 0.913 | 0.525 |
| 2.202256450166447 | 0.742 | 0.916 | 0.527 |
| 2.205398042820036 | 0.74 | 0.919 | 0.528 |
| 2.208539635473626 | 0.738 | 0.922 | 0.53 |
| 2.211681228127216 | 0.737 | 0.925 | 0.532 |
| 2.214822820780805 | 0.735 | 0.928 | 0.533 |
| 2.217964413434395 | 0.733 | 0.931 | 0.535 |
| 2.221106006087984 | 0.732 | 0.934 | 0.537 |
| 2.224247598741574 | 0.73 | 0.936 | 0.539 |
| 2.227389191395164 | 0.729 | 0.939 | 0.541 |
| 2.230530784048753 | 0.727 | 0.942 | 0.543 |
| 2.233672376702343 | 0.725 | 0.944 | 0.545 |
| 2.236813969355933 | 0.724 | 0.947 | 0.547 |
| 2.239955562009522 | 0.722 | 0.95 | 0.549 |
| 2.243097154663112 | 0.721 | 0.952 | 0.551 |
| 2.246238747316701 | 0.719 | 0.955 | 0.554 |
| 2.249380339970291 | 0.717 | 0.957 | 0.556 |
| 2.252521932623881 | 0.716 | 0.959 | 0.558 |
| 2.25566352527747 | 0.714 | 0.962 | 0.561 |
| 2.25880511793106 | 0.713 | 0.964 | 0.563 |
| 2.261946710584649 | 0.711 | 0.966 | 0.566 |
| 2.265088303238239 | 0.71 | 0.968 | 0.568 |
| 2.268229895891829 | 0.708 | 0.97 | 0.571 |
| 2.271371488545418 | 0.706 | 0.972 | 0.574 |
| 2.274513081199008 | 0.705 | 0.974 | 0.576 |
| 2.277654673852597 | 0.703 | 0.976 | 0.579 |
| 2.280796266506186 | 0.702 | 0.978 | 0.582 |
| 2.283937859159776 | 0.7 | 0.98 | 0.585 |
| 2.287079451813366 | 0.699 | 0.981 | 0.588 |
| 2.290221044466955 | 0.697 | 0.983 | 0.591 |
| 2.293362637120545 | 0.696 | 0.985 | 0.594 |
| 2.296504229774135 | 0.694 | 0.986 | 0.597 |
| 2.299645822427724 | 0.693 | 0.987 | 0.6 |
| 2.302787415081314 | 0.691 | 0.989 | 0.603 |
| 2.305929007734904 | 0.69 | 0.99 | 0.607 |
| 2.309070600388493 | 0.688 | 0.991 | 0.61 |
| 2.312212193042083 | 0.687 | 0.992 | 0.613 |
| 2.315353785695672 | 0.685 | 0.993 | 0.617 |
| 2.318495378349262 | 0.684 | 0.994 | 0.62 |
| 2.321636971002852 | 0.682 | 0.995 | 0.624 |
| 2.324778563656441 | 0.681 | 0.996 | 0.627 |
| 2.327920156310031 | 0.679 | 0.997 | 0.631 |
| 2.33106174896362 | 0.678 | 0.997 | 0.635 |
| 2.33420334161721 | 0.677 | 0.998 | 0.639 |
| 2.3373449342708 | 0.675 | 0.999 | 0.642 |
| 2.340486526924389 | 0.674 | 0.999 | 0.646 |
| 2.343628119577979 | 0.672 | 0.999 | 0.65 |
| 2.346769712231568 | 0.671 | 1 | 0.654 |
| 2.349911304885158 | 0.669 | 1 | 0.658 |
| 2.353052897538748 | 0.668 | 1 | 0.663 |
| 2.356194490192337 | 0.667 | 1 | 0.667 |
| 2.359336082845927 | 0.665 | 1 | 0.671 |
| 2.362477675499516 | 0.664 | 1 | 0.675 |
| 2.365619268153106 | 0.663 | 1 | 0.679 |
| 2.368760860806696 | 0.661 | 0.999 | 0.684 |
| 2.371902453460285 | 0.66 | 0.999 | 0.688 |
| 2.375044046113875 | 0.658 | 0.999 | 0.693 |
| 2.378185638767464 | 0.657 | 0.998 | 0.697 |
| 2.381327231421054 | 0.656 | 0.997 | 0.702 |
| 2.384468824074644 | 0.654 | 0.997 | 0.706 |
| 2.387610416728233 | 0.653 | 0.996 | 0.711 |
| 2.390752009381823 | 0.652 | 0.995 | 0.716 |
| 2.393893602035412 | 0.65 | 0.994 | 0.721 |
| 2.397035194689002 | 0.649 | 0.993 | 0.725 |
| 2.400176787342591 | 0.648 | 0.992 | 0.73 |
| 2.403318379996181 | 0.646 | 0.991 | 0.735 |
| 2.406459972649771 | 0.645 | 0.99 | 0.74 |
| 2.40960156530336 | 0.644 | 0.989 | 0.745 |
| 2.41274315795695 | 0.642 | 0.987 | 0.75 |
| 2.41588475061054 | 0.641 | 0.986 | 0.755 |
| 2.419026343264129 | 0.64 | 0.985 | 0.76 |
| 2.422167935917719 | 0.639 | 0.983 | 0.765 |
| 2.425309528571308 | 0.637 | 0.981 | 0.77 |
| 2.428451121224898 | 0.636 | 0.98 | 0.775 |
| 2.431592713878488 | 0.635 | 0.978 | 0.78 |
| 2.434734306532077 | 0.634 | 0.976 | 0.786 |
| 2.437875899185667 | 0.632 | 0.974 | 0.791 |
| 2.441017491839256 | 0.631 | 0.972 | 0.796 |
| 2.444159084492846 | 0.63 | 0.97 | 0.801 |
| 2.447300677146435 | 0.629 | 0.968 | 0.806 |
| 2.450442269800025 | 0.627 | 0.966 | 0.812 |
| 2.453583862453615 | 0.626 | 0.964 | 0.817 |
| 2.456725455107204 | 0.625 | 0.962 | 0.822 |
| 2.459867047760794 | 0.624 | 0.959 | 0.827 |
| 2.463008640414384 | 0.623 | 0.957 | 0.833 |
| 2.466150233067973 | 0.621 | 0.955 | 0.838 |
| 2.469291825721563 | 0.62 | 0.952 | 0.843 |
| 2.472433418375152 | 0.619 | 0.95 | 0.848 |
| 2.475575011028742 | 0.618 | 0.947 | 0.853 |
| 2.478716603682332 | 0.617 | 0.944 | 0.859 |
| 2.481858196335921 | 0.616 | 0.942 | 0.864 |
| 2.48499978898951 | 0.614 | 0.939 | 0.869 |
| 2.4881413816431 | 0.613 | 0.936 | 0.874 |
| 2.49128297429669 | 0.612 | 0.934 | 0.879 |
| 2.49442456695028 | 0.611 | 0.931 | 0.884 |
| 2.497566159603869 | 0.61 | 0.928 | 0.889 |
| 2.500707752257458 | 0.609 | 0.925 | 0.894 |
| 2.503849344911048 | 0.608 | 0.922 | 0.899 |
| 2.506990937564638 | 0.607 | 0.919 | 0.903 |
| 2.510132530218228 | 0.606 | 0.916 | 0.908 |
| 2.513274122871817 | 0.604 | 0.913 | 0.913 |
| 2.516415715525407 | 0.603 | 0.91 | 0.917 |
| 2.519557308178996 | 0.602 | 0.907 | 0.922 |
| 2.522698900832586 | 0.601 | 0.903 | 0.926 |
| 2.525840493486176 | 0.6 | 0.9 | 0.931 |
| 2.528982086139765 | 0.599 | 0.897 | 0.935 |
| 2.532123678793355 | 0.598 | 0.894 | 0.939 |
| 2.535265271446944 | 0.597 | 0.891 | 0.943 |
| 2.538406864100534 | 0.596 | 0.887 | 0.947 |
| 2.541548456754124 | 0.595 | 0.884 | 0.951 |
| 2.544690049407713 | 0.594 | 0.881 | 0.955 |
| 2.547831642061302 | 0.593 | 0.877 | 0.958 |
| 2.550973234714892 | 0.592 | 0.874 | 0.962 |
| 2.554114827368482 | 0.591 | 0.871 | 0.965 |
| 2.557256420022072 | 0.59 | 0.867 | 0.968 |
| 2.560398012675661 | 0.589 | 0.864 | 0.971 |
| 2.563539605329251 | 0.588 | 0.86 | 0.974 |
| 2.56668119798284 | 0.587 | 0.857 | 0.977 |
| 2.56982279063643 | 0.586 | 0.853 | 0.98 |
| 2.57296438329002 | 0.585 | 0.85 | 0.982 |
| 2.576105975943609 | 0.584 | 0.847 | 0.985 |
| 2.579247568597199 | 0.583 | 0.843 | 0.987 |
| 2.582389161250788 | 0.582 | 0.84 | 0.989 |
| 2.585530753904377 | 0.581 | 0.836 | 0.991 |
| 2.588672346557967 | 0.58 | 0.833 | 0.992 |
| 2.591813939211557 | 0.579 | 0.829 | 0.994 |
| 2.594955531865147 | 0.578 | 0.826 | 0.995 |
| 2.598097124518736 | 0.577 | 0.822 | 0.996 |
| 2.601238717172326 | 0.576 | 0.819 | 0.997 |
| 2.604380309825915 | 0.575 | 0.815 | 0.998 |
| 2.607521902479505 | 0.574 | 0.812 | 0.999 |
| 2.610663495133095 | 0.574 | 0.808 | 1 |
| 2.613805087786684 | 0.573 | 0.805 | 1 |
| 2.616946680440274 | 0.572 | 0.801 | 1 |
| 2.620088273093863 | 0.571 | 0.798 | 1 |
| 2.623229865747452 | 0.57 | 0.794 | 1 |
| 2.626371458401042 | 0.569 | 0.791 | 0.999 |
| 2.629513051054632 | 0.568 | 0.787 | 0.999 |
| 2.632654643708222 | 0.567 | 0.784 | 0.998 |
| 2.635796236361811 | 0.566 | 0.78 | 0.997 |
| 2.638937829015401 | 0.566 | 0.777 | 0.996 |
| 2.642079421668991 | 0.565 | 0.774 | 0.995 |
| 2.64522101432258 | 0.564 | 0.77 | 0.993 |
| 2.64836260697617 | 0.563 | 0.767 | 0.992 |
| 2.651504199629759 | 0.562 | 0.763 | 0.99 |
| 2.654645792283349 | 0.561 | 0.76 | 0.988 |
| 2.657787384936938 | 0.561 | 0.757 | 0.986 |
| 2.660928977590528 | 0.56 | 0.753 | 0.984 |
| 2.664070570244118 | 0.559 | 0.75 | 0.981 |
| 2.667212162897707 | 0.558 | 0.747 | 0.979 |
| 2.670353755551297 | 0.557 | 0.743 | 0.976 |
| 2.673495348204887 | 0.557 | 0.74 | 0.973 |
| 2.676636940858476 | 0.556 | 0.737 | 0.97 |
| 2.679778533512066 | 0.555 | 0.733 | 0.967 |
| 2.682920126165655 | 0.554 | 0.73 | 0.964 |
| 2.686061718819245 | 0.554 | 0.727 | 0.961 |
| 2.689203311472835 | 0.553 | 0.724 | 0.957 |
| 2.692344904126424 | 0.552 | 0.721 | 0.953 |
| 2.695486496780014 | 0.551 | 0.717 | 0.95 |
| 2.698628089433603 | 0.551 | 0.714 | 0.946 |
| 2.701769682087193 | 0.55 | 0.711 | 0.942 |
| 2.704911274740782 | 0.549 | 0.708 | 0.938 |
| 2.708052867394372 | 0.548 | 0.705 | 0.934 |
| 2.711194460047962 | 0.548 | 0.702 | 0.929 |
| 2.714336052701551 | 0.547 | 0.699 | 0.925 |
| 2.717477645355141 | 0.546 | 0.696 | 0.92 |
| 2.720619238008731 | 0.546 | 0.693 | 0.916 |
| 2.72376083066232 | 0.545 | 0.69 | 0.911 |
| 2.72690242331591 | 0.544 | 0.687 | 0.907 |
| 2.730044015969499 | 0.543 | 0.684 | 0.902 |
| 2.733185608623089 | 0.543 | 0.681 | 0.897 |
| 2.736327201276678 | 0.542 | 0.678 | 0.892 |
| 2.739468793930268 | 0.541 | 0.675 | 0.887 |
| 2.742610386583858 | 0.541 | 0.672 | 0.882 |
| 2.745751979237447 | 0.54 | 0.669 | 0.877 |
| 2.748893571891036 | 0.54 | 0.667 | 0.872 |
| 2.752035164544627 | 0.539 | 0.664 | 0.867 |
| 2.755176757198216 | 0.538 | 0.661 | 0.862 |
| 2.758318349851806 | 0.538 | 0.658 | 0.857 |
| 2.761459942505395 | 0.537 | 0.656 | 0.852 |
| 2.764601535158985 | 0.536 | 0.653 | 0.847 |
| 2.767743127812574 | 0.536 | 0.65 | 0.841 |
| 2.770884720466164 | 0.535 | 0.648 | 0.836 |
| 2.774026313119754 | 0.535 | 0.645 | 0.831 |
| 2.777167905773343 | 0.534 | 0.642 | 0.826 |
| 2.780309498426932 | 0.533 | 0.64 | 0.82 |
| 2.783451091080522 | 0.533 | 0.637 | 0.815 |
| 2.786592683734112 | 0.532 | 0.635 | 0.81 |
| 2.789734276387701 | 0.532 | 0.632 | 0.805 |
| 2.792875869041291 | 0.531 | 0.63 | 0.799 |
| 2.796017461694881 | 0.53 | 0.627 | 0.794 |
| 2.79915905434847 | 0.53 | 0.625 | 0.789 |
| 2.80230064700206 | 0.529 | 0.623 | 0.784 |
| 2.80544223965565 | 0.529 | 0.62 | 0.779 |
| 2.808583832309239 | 0.528 | 0.618 | 0.774 |
| 2.811725424962829 | 0.528 | 0.616 | 0.768 |
| 2.814867017616419 | 0.527 | 0.613 | 0.763 |
| 2.818008610270008 | 0.527 | 0.611 | 0.758 |
| 2.821150202923598 | 0.526 | 0.609 | 0.753 |
| 2.824291795577187 | 0.526 | 0.607 | 0.748 |
| 2.827433388230777 | 0.525 | 0.604 | 0.743 |
| 2.830574980884366 | 0.525 | 0.602 | 0.738 |
| 2.833716573537956 | 0.524 | 0.6 | 0.733 |
| 2.836858166191546 | 0.524 | 0.598 | 0.729 |
| 2.839999758845135 | 0.523 | 0.596 | 0.724 |
| 2.843141351498725 | 0.523 | 0.594 | 0.719 |
| 2.846282944152314 | 0.522 | 0.592 | 0.714 |
| 2.849424536805904 | 0.522 | 0.59 | 0.71 |
| 2.852566129459494 | 0.521 | 0.588 | 0.705 |
| 2.855707722113083 | 0.521 | 0.586 | 0.7 |
| 2.858849314766673 | 0.52 | 0.584 | 0.696 |
| 2.861990907420262 | 0.52 | 0.582 | 0.691 |
| 2.865132500073852 | 0.519 | 0.58 | 0.687 |
| 2.868274092727442 | 0.519 | 0.578 | 0.682 |
| 2.871415685381031 | 0.518 | 0.576 | 0.678 |
| 2.874557278034621 | 0.518 | 0.574 | 0.674 |
| 2.87769887068821 | 0.518 | 0.573 | 0.669 |
| 2.8808404633418 | 0.517 | 0.571 | 0.665 |
| 2.88398205599539 | 0.517 | 0.569 | 0.661 |
| 2.88712364864898 | 0.516 | 0.567 | 0.657 |
| 2.890265241302569 | 0.516 | 0.566 | 0.653 |
| 2.893406833956158 | 0.516 | 0.564 | 0.649 |
| 2.896548426609748 | 0.515 | 0.562 | 0.645 |
| 2.899690019263338 | 0.515 | 0.561 | 0.641 |
| 2.902831611916927 | 0.514 | 0.559 | 0.637 |
| 2.905973204570517 | 0.514 | 0.557 | 0.634 |
| 2.909114797224106 | 0.514 | 0.556 | 0.63 |
| 2.912256389877696 | 0.513 | 0.554 | 0.626 |
| 2.915397982531286 | 0.513 | 0.553 | 0.623 |
| 2.918539575184875 | 0.513 | 0.551 | 0.619 |
| 2.921681167838465 | 0.512 | 0.55 | 0.616 |
| 2.924822760492054 | 0.512 | 0.548 | 0.612 |
| 2.927964353145644 | 0.511 | 0.547 | 0.609 |
| 2.931105945799234 | 0.511 | 0.546 | 0.606 |
| 2.934247538452823 | 0.511 | 0.544 | 0.602 |
| 2.937389131106413 | 0.51 | 0.543 | 0.599 |
| 2.940530723760002 | 0.51 | 0.541 | 0.596 |
| 2.943672316413592 | 0.51 | 0.54 | 0.593 |
| 2.946813909067182 | 0.51 | 0.539 | 0.59 |
| 2.949955501720771 | 0.509 | 0.538 | 0.587 |
| 2.953097094374361 | 0.509 | 0.536 | 0.584 |
| 2.95623868702795 | 0.509 | 0.535 | 0.581 |
| 2.95938027968154 | 0.508 | 0.534 | 0.578 |
| 2.96252187233513 | 0.508 | 0.533 | 0.575 |
| 2.965663464988719 | 0.508 | 0.532 | 0.573 |
| 2.968805057642309 | 0.508 | 0.53 | 0.57 |
| 2.971946650295898 | 0.507 | 0.529 | 0.567 |
| 2.975088242949488 | 0.507 | 0.528 | 0.565 |
| 2.978229835603078 | 0.507 | 0.527 | 0.562 |
| 2.981371428256667 | 0.506 | 0.526 | 0.56 |
| 2.984513020910257 | 0.506 | 0.525 | 0.557 |
| 2.987654613563846 | 0.506 | 0.524 | 0.555 |
| 2.990796206217436 | 0.506 | 0.523 | 0.553 |
| 2.993937798871025 | 0.505 | 0.522 | 0.551 |
| 2.997079391524615 | 0.505 | 0.521 | 0.548 |
| 3.000220984178205 | 0.505 | 0.52 | 0.546 |
| 3.003362576831794 | 0.505 | 0.519 | 0.544 |
| 3.006504169485384 | 0.505 | 0.518 | 0.542 |
| 3.009645762138974 | 0.504 | 0.518 | 0.54 |
| 3.012787354792563 | 0.504 | 0.517 | 0.538 |
| 3.015928947446153 | 0.504 | 0.516 | 0.536 |
| 3.019070540099742 | 0.504 | 0.515 | 0.535 |
| 3.022212132753332 | 0.504 | 0.514 | 0.533 |
| 3.025353725406922 | 0.503 | 0.514 | 0.531 |
| 3.028495318060511 | 0.503 | 0.513 | 0.529 |
| 3.031636910714101 | 0.503 | 0.512 | 0.528 |
| 3.03477850336769 | 0.503 | 0.511 | 0.526 |
| 3.03792009602128 | 0.503 | 0.511 | 0.525 |
| 3.04106168867487 | 0.503 | 0.51 | 0.523 |
| 3.04420328132846 | 0.502 | 0.51 | 0.522 |
| 3.047344873982049 | 0.502 | 0.509 | 0.52 |
| 3.050486466635638 | 0.502 | 0.508 | 0.519 |
| 3.053628059289228 | 0.502 | 0.508 | 0.518 |
| 3.056769651942818 | 0.502 | 0.507 | 0.516 |
| 3.059911244596407 | 0.502 | 0.507 | 0.515 |
| 3.063052837249997 | 0.502 | 0.506 | 0.514 |
| 3.066194429903586 | 0.501 | 0.506 | 0.513 |
| 3.069336022557176 | 0.501 | 0.505 | 0.512 |
| 3.072477615210766 | 0.501 | 0.505 | 0.511 |
| 3.075619207864355 | 0.501 | 0.504 | 0.51 |
| 3.078760800517945 | 0.501 | 0.504 | 0.509 |
| 3.081902393171534 | 0.501 | 0.504 | 0.508 |
| 3.085043985825124 | 0.501 | 0.503 | 0.507 |
| 3.088185578478713 | 0.501 | 0.503 | 0.506 |
| 3.091327171132303 | 0.501 | 0.503 | 0.506 |
| 3.094468763785893 | 0.501 | 0.502 | 0.505 |
| 3.097610356439482 | 0.5 | 0.502 | 0.504 |
| 3.100751949093072 | 0.5 | 0.502 | 0.504 |
| 3.103893541746661 | 0.5 | 0.501 | 0.503 |
| 3.107035134400251 | 0.5 | 0.501 | 0.503 |
| 3.110176727053841 | 0.5 | 0.501 | 0.502 |
| 3.11331831970743 | 0.5 | 0.501 | 0.502 |
| 3.11645991236102 | 0.5 | 0.501 | 0.501 |
| 3.11960150501461 | 0.5 | 0.5 | 0.501 |
| 3.122743097668199 | 0.5 | 0.5 | 0.501 |
| 3.125884690321789 | 0.5 | 0.5 | 0.501 |
| 3.129026282975378 | 0.5 | 0.5 | 0.5 |
| 3.132167875628968 | 0.5 | 0.5 | 0.5 |
| 3.135309468282557 | 0.5 | 0.5 | 0.5 |
| 3.138451060936147 | 0.5 | 0.5 | 0.5 |
| 3.141592653589737 | 0.5 | 0.5 | 0.5 |
| 3.144734246243326 | 0.5 | 0.5 | 0.5 |
| 3.147875838896916 | 0.5 | 0.5 | 0.5 |
| 3.151017431550505 | 0.5 | 0.5 | 0.5 |
| 3.154159024204095 | 0.5 | 0.5 | 0.5 |
| 3.157300616857685 | 0.5 | 0.5 | 0.501 |
| 3.160442209511274 | 0.5 | 0.5 | 0.501 |
| 3.163583802164864 | 0.5 | 0.5 | 0.501 |
| 3.166725394818453 | 0.5 | 0.501 | 0.501 |
| 3.169866987472043 | 0.5 | 0.501 | 0.502 |
| 3.173008580125633 | 0.5 | 0.501 | 0.502 |
| 3.176150172779222 | 0.5 | 0.501 | 0.503 |
| 3.179291765432812 | 0.5 | 0.501 | 0.503 |
| 3.182433358086401 | 0.5 | 0.502 | 0.504 |
| 3.185574950739991 | 0.5 | 0.502 | 0.504 |
| 3.188716543393581 | 0.501 | 0.502 | 0.505 |
| 3.19185813604717 | 0.501 | 0.503 | 0.506 |
| 3.19499972870076 | 0.501 | 0.503 | 0.506 |
| 3.198141321354349 | 0.501 | 0.503 | 0.507 |
| 3.20128291400794 | 0.501 | 0.504 | 0.508 |
| 3.204424506661528 | 0.501 | 0.504 | 0.509 |
| 3.207566099315118 | 0.501 | 0.504 | 0.51 |
| 3.210707691968708 | 0.501 | 0.505 | 0.511 |
| 3.213849284622297 | 0.501 | 0.505 | 0.512 |
| 3.216990877275887 | 0.501 | 0.506 | 0.513 |
| 3.220132469929476 | 0.502 | 0.506 | 0.514 |
| 3.223274062583066 | 0.502 | 0.507 | 0.515 |
| 3.226415655236656 | 0.502 | 0.507 | 0.516 |
| 3.229557247890245 | 0.502 | 0.508 | 0.518 |
| 3.232698840543835 | 0.502 | 0.508 | 0.519 |
| 3.235840433197425 | 0.502 | 0.509 | 0.52 |
| 3.238982025851014 | 0.502 | 0.51 | 0.522 |
| 3.242123618504604 | 0.503 | 0.51 | 0.523 |
| 3.245265211158193 | 0.503 | 0.511 | 0.525 |
| 3.248406803811783 | 0.503 | 0.511 | 0.526 |
| 3.251548396465373 | 0.503 | 0.512 | 0.528 |
| 3.254689989118962 | 0.503 | 0.513 | 0.529 |
| 3.257831581772551 | 0.503 | 0.514 | 0.531 |
| 3.260973174426141 | 0.504 | 0.514 | 0.533 |
| 3.26411476707973 | 0.504 | 0.515 | 0.535 |
| 3.267256359733321 | 0.504 | 0.516 | 0.536 |
| 3.27039795238691 | 0.504 | 0.517 | 0.538 |
| 3.2735395450405 | 0.504 | 0.518 | 0.54 |
| 3.276681137694089 | 0.505 | 0.518 | 0.542 |
| 3.279822730347679 | 0.505 | 0.519 | 0.544 |
| 3.282964323001269 | 0.505 | 0.52 | 0.546 |
| 3.286105915654858 | 0.505 | 0.521 | 0.548 |
| 3.289247508308448 | 0.505 | 0.522 | 0.551 |
| 3.292389100962037 | 0.506 | 0.523 | 0.553 |
| 3.295530693615627 | 0.506 | 0.524 | 0.555 |
| 3.298672286269217 | 0.506 | 0.525 | 0.557 |
| 3.301813878922806 | 0.506 | 0.526 | 0.56 |
| 3.304955471576396 | 0.507 | 0.527 | 0.562 |
| 3.308097064229985 | 0.507 | 0.528 | 0.565 |
| 3.311238656883575 | 0.507 | 0.529 | 0.567 |
| 3.314380249537165 | 0.508 | 0.53 | 0.57 |
| 3.317521842190754 | 0.508 | 0.532 | 0.573 |
| 3.320663434844344 | 0.508 | 0.533 | 0.575 |
| 3.323805027497933 | 0.508 | 0.534 | 0.578 |
| 3.326946620151523 | 0.509 | 0.535 | 0.581 |
| 3.330088212805113 | 0.509 | 0.536 | 0.584 |
| 3.333229805458702 | 0.509 | 0.538 | 0.587 |
| 3.336371398112292 | 0.51 | 0.539 | 0.59 |
| 3.339512990765881 | 0.51 | 0.54 | 0.593 |
| 3.342654583419471 | 0.51 | 0.541 | 0.596 |
| 3.345796176073061 | 0.51 | 0.543 | 0.599 |
| 3.34893776872665 | 0.511 | 0.544 | 0.602 |
| 3.35207936138024 | 0.511 | 0.546 | 0.606 |
| 3.355220954033829 | 0.511 | 0.547 | 0.609 |
| 3.358362546687419 | 0.512 | 0.548 | 0.612 |
| 3.361504139341009 | 0.512 | 0.55 | 0.616 |
| 3.364645731994598 | 0.513 | 0.551 | 0.619 |
| 3.367787324648188 | 0.513 | 0.553 | 0.623 |
| 3.370928917301777 | 0.513 | 0.554 | 0.626 |
| 3.374070509955367 | 0.514 | 0.556 | 0.63 |
| 3.377212102608956 | 0.514 | 0.557 | 0.634 |
| 3.380353695262546 | 0.514 | 0.559 | 0.637 |
| 3.383495287916136 | 0.515 | 0.561 | 0.641 |
| 3.386636880569725 | 0.515 | 0.562 | 0.645 |
| 3.389778473223315 | 0.516 | 0.564 | 0.649 |
| 3.392920065876904 | 0.516 | 0.566 | 0.653 |
| 3.396061658530494 | 0.516 | 0.567 | 0.657 |
| 3.399203251184084 | 0.517 | 0.569 | 0.661 |
| 3.402344843837673 | 0.517 | 0.571 | 0.665 |
| 3.405486436491263 | 0.518 | 0.573 | 0.669 |
| 3.408628029144852 | 0.518 | 0.574 | 0.674 |
| 3.411769621798442 | 0.518 | 0.576 | 0.678 |
| 3.414911214452032 | 0.519 | 0.578 | 0.682 |
| 3.418052807105621 | 0.519 | 0.58 | 0.687 |
| 3.421194399759211 | 0.52 | 0.582 | 0.691 |
| 3.4243359924128 | 0.52 | 0.584 | 0.696 |
| 3.42747758506639 | 0.521 | 0.586 | 0.7 |
| 3.43061917771998 | 0.521 | 0.588 | 0.705 |
| 3.433760770373569 | 0.522 | 0.59 | 0.71 |
| 3.436902363027159 | 0.522 | 0.592 | 0.714 |
| 3.440043955680748 | 0.523 | 0.594 | 0.719 |
| 3.443185548334338 | 0.523 | 0.596 | 0.724 |
| 3.446327140987927 | 0.524 | 0.598 | 0.729 |
| 3.449468733641517 | 0.524 | 0.6 | 0.733 |
| 3.452610326295107 | 0.525 | 0.602 | 0.738 |
| 3.455751918948696 | 0.525 | 0.604 | 0.743 |
| 3.458893511602286 | 0.526 | 0.607 | 0.748 |
| 3.462035104255876 | 0.526 | 0.609 | 0.753 |
| 3.465176696909465 | 0.527 | 0.611 | 0.758 |
| 3.468318289563055 | 0.527 | 0.613 | 0.763 |
| 3.471459882216644 | 0.528 | 0.616 | 0.768 |
| 3.474601474870234 | 0.528 | 0.618 | 0.774 |
| 3.477743067523824 | 0.529 | 0.62 | 0.779 |
| 3.480884660177413 | 0.529 | 0.623 | 0.784 |
| 3.484026252831002 | 0.53 | 0.625 | 0.789 |
| 3.487167845484592 | 0.53 | 0.627 | 0.794 |
| 3.490309438138182 | 0.531 | 0.63 | 0.799 |
| 3.493451030791772 | 0.532 | 0.632 | 0.805 |
| 3.496592623445361 | 0.532 | 0.635 | 0.81 |
| 3.499734216098951 | 0.533 | 0.637 | 0.815 |
| 3.50287580875254 | 0.533 | 0.64 | 0.82 |
| 3.50601740140613 | 0.534 | 0.642 | 0.826 |
| 3.50915899405972 | 0.535 | 0.645 | 0.831 |
| 3.512300586713309 | 0.535 | 0.648 | 0.836 |
| 3.515442179366899 | 0.536 | 0.65 | 0.841 |
| 3.518583772020488 | 0.536 | 0.653 | 0.847 |
| 3.521725364674078 | 0.537 | 0.656 | 0.852 |
| 3.524866957327668 | 0.538 | 0.658 | 0.857 |
| 3.528008549981257 | 0.538 | 0.661 | 0.862 |
| 3.531150142634847 | 0.539 | 0.664 | 0.867 |
| 3.534291735288436 | 0.54 | 0.667 | 0.872 |
| 3.537433327942026 | 0.54 | 0.669 | 0.877 |
| 3.540574920595616 | 0.541 | 0.672 | 0.882 |
| 3.543716513249205 | 0.541 | 0.675 | 0.887 |
| 3.546858105902795 | 0.542 | 0.678 | 0.892 |
| 3.549999698556384 | 0.543 | 0.681 | 0.897 |
| 3.553141291209974 | 0.543 | 0.684 | 0.902 |
| 3.556282883863564 | 0.544 | 0.687 | 0.907 |
| 3.559424476517153 | 0.545 | 0.69 | 0.911 |
| 3.562566069170743 | 0.546 | 0.693 | 0.916 |
| 3.565707661824332 | 0.546 | 0.696 | 0.92 |
| 3.568849254477922 | 0.547 | 0.699 | 0.925 |
| 3.571990847131511 | 0.548 | 0.702 | 0.929 |
| 3.575132439785101 | 0.548 | 0.705 | 0.934 |
| 3.578274032438691 | 0.549 | 0.708 | 0.938 |
| 3.58141562509228 | 0.55 | 0.711 | 0.942 |
| 3.58455721774587 | 0.551 | 0.714 | 0.946 |
| 3.58769881039946 | 0.551 | 0.717 | 0.95 |
| 3.590840403053049 | 0.552 | 0.721 | 0.953 |
| 3.593981995706639 | 0.553 | 0.724 | 0.957 |
| 3.597123588360228 | 0.554 | 0.727 | 0.961 |
| 3.600265181013818 | 0.554 | 0.73 | 0.964 |
| 3.603406773667407 | 0.555 | 0.733 | 0.967 |
| 3.606548366320997 | 0.556 | 0.737 | 0.97 |
| 3.609689958974587 | 0.557 | 0.74 | 0.973 |
| 3.612831551628176 | 0.557 | 0.743 | 0.976 |
| 3.615973144281766 | 0.558 | 0.747 | 0.979 |
| 3.619114736935355 | 0.559 | 0.75 | 0.981 |
| 3.622256329588945 | 0.56 | 0.753 | 0.984 |
| 3.625397922242534 | 0.561 | 0.757 | 0.986 |
| 3.628539514896124 | 0.561 | 0.76 | 0.988 |
| 3.631681107549714 | 0.562 | 0.763 | 0.99 |
| 3.634822700203303 | 0.563 | 0.767 | 0.992 |
| 3.637964292856893 | 0.564 | 0.77 | 0.993 |
| 3.641105885510483 | 0.565 | 0.774 | 0.995 |
| 3.644247478164072 | 0.566 | 0.777 | 0.996 |
| 3.647389070817662 | 0.566 | 0.78 | 0.997 |
| 3.650530663471251 | 0.567 | 0.784 | 0.998 |
| 3.653672256124841 | 0.568 | 0.787 | 0.999 |
| 3.656813848778431 | 0.569 | 0.791 | 0.999 |
| 3.65995544143202 | 0.57 | 0.794 | 1 |
| 3.66309703408561 | 0.571 | 0.798 | 1 |
| 3.666238626739199 | 0.572 | 0.801 | 1 |
| 3.66938021939279 | 0.573 | 0.805 | 1 |
| 3.672521812046378 | 0.574 | 0.808 | 1 |
| 3.675663404699968 | 0.574 | 0.812 | 0.999 |
| 3.678804997353558 | 0.575 | 0.815 | 0.998 |
| 3.681946590007147 | 0.576 | 0.819 | 0.997 |
| 3.685088182660737 | 0.577 | 0.822 | 0.996 |
| 3.688229775314326 | 0.578 | 0.826 | 0.995 |
| 3.691371367967916 | 0.579 | 0.829 | 0.994 |
| 3.694512960621506 | 0.58 | 0.833 | 0.992 |
| 3.697654553275095 | 0.581 | 0.836 | 0.991 |
| 3.700796145928685 | 0.582 | 0.84 | 0.989 |
| 3.703937738582274 | 0.583 | 0.843 | 0.987 |
| 3.707079331235864 | 0.584 | 0.847 | 0.985 |
| 3.710220923889454 | 0.585 | 0.85 | 0.982 |
| 3.713362516543043 | 0.586 | 0.853 | 0.98 |
| 3.716504109196633 | 0.587 | 0.857 | 0.977 |
| 3.719645701850223 | 0.588 | 0.86 | 0.974 |
| 3.722787294503812 | 0.589 | 0.864 | 0.971 |
| 3.725928887157402 | 0.59 | 0.867 | 0.968 |
| 3.729070479810991 | 0.591 | 0.871 | 0.965 |
| 3.732212072464581 | 0.592 | 0.874 | 0.962 |
| 3.735353665118171 | 0.593 | 0.877 | 0.958 |
| 3.73849525777176 | 0.594 | 0.881 | 0.955 |
| 3.74163685042535 | 0.595 | 0.884 | 0.951 |
| 3.744778443078939 | 0.596 | 0.887 | 0.947 |
| 3.747920035732529 | 0.597 | 0.891 | 0.943 |
| 3.751061628386119 | 0.598 | 0.894 | 0.939 |
| 3.754203221039708 | 0.599 | 0.897 | 0.935 |
| 3.757344813693298 | 0.6 | 0.9 | 0.931 |
| 3.760486406346887 | 0.601 | 0.903 | 0.926 |
| 3.763627999000477 | 0.602 | 0.907 | 0.922 |
| 3.766769591654067 | 0.603 | 0.91 | 0.917 |
| 3.769911184307656 | 0.604 | 0.913 | 0.913 |
| 3.773052776961246 | 0.606 | 0.916 | 0.908 |
| 3.776194369614835 | 0.607 | 0.919 | 0.903 |
| 3.779335962268425 | 0.608 | 0.922 | 0.899 |
| 3.782477554922014 | 0.609 | 0.925 | 0.894 |
| 3.785619147575604 | 0.61 | 0.928 | 0.889 |
| 3.788760740229193 | 0.611 | 0.931 | 0.884 |
| 3.791902332882783 | 0.612 | 0.934 | 0.879 |
| 3.795043925536373 | 0.613 | 0.936 | 0.874 |
| 3.798185518189962 | 0.614 | 0.939 | 0.869 |
| 3.801327110843552 | 0.616 | 0.942 | 0.864 |
| 3.804468703497142 | 0.617 | 0.944 | 0.859 |
| 3.807610296150731 | 0.618 | 0.947 | 0.853 |
| 3.810751888804321 | 0.619 | 0.95 | 0.848 |
| 3.813893481457911 | 0.62 | 0.952 | 0.843 |
| 3.8170350741115 | 0.621 | 0.955 | 0.838 |
| 3.82017666676509 | 0.623 | 0.957 | 0.833 |
| 3.823318259418679 | 0.624 | 0.959 | 0.827 |
| 3.826459852072269 | 0.625 | 0.962 | 0.822 |
| 3.829601444725859 | 0.626 | 0.964 | 0.817 |
| 3.832743037379448 | 0.627 | 0.966 | 0.812 |
| 3.835884630033038 | 0.629 | 0.968 | 0.806 |
| 3.839026222686627 | 0.63 | 0.97 | 0.801 |
| 3.842167815340217 | 0.631 | 0.972 | 0.796 |
| 3.845309407993807 | 0.632 | 0.974 | 0.791 |
| 3.848451000647396 | 0.634 | 0.976 | 0.786 |
| 3.851592593300986 | 0.635 | 0.978 | 0.78 |
| 3.854734185954575 | 0.636 | 0.98 | 0.775 |
| 3.857875778608165 | 0.637 | 0.981 | 0.77 |
| 3.861017371261755 | 0.639 | 0.983 | 0.765 |
| 3.864158963915344 | 0.64 | 0.985 | 0.76 |
| 3.867300556568933 | 0.641 | 0.986 | 0.755 |
| 3.870442149222523 | 0.642 | 0.987 | 0.75 |
| 3.873583741876112 | 0.644 | 0.989 | 0.745 |
| 3.876725334529703 | 0.645 | 0.99 | 0.74 |
| 3.879866927183292 | 0.646 | 0.991 | 0.735 |
| 3.883008519836882 | 0.648 | 0.992 | 0.73 |
| 3.886150112490471 | 0.649 | 0.993 | 0.725 |
| 3.889291705144061 | 0.65 | 0.994 | 0.721 |
| 3.892433297797651 | 0.652 | 0.995 | 0.716 |
| 3.89557489045124 | 0.653 | 0.996 | 0.711 |
| 3.89871648310483 | 0.654 | 0.997 | 0.706 |
| 3.901858075758419 | 0.656 | 0.997 | 0.702 |
| 3.904999668412009 | 0.657 | 0.998 | 0.697 |
| 3.908141261065598 | 0.658 | 0.999 | 0.693 |
| 3.911282853719188 | 0.66 | 0.999 | 0.688 |
| 3.914424446372778 | 0.661 | 0.999 | 0.684 |
| 3.917566039026367 | 0.663 | 1 | 0.679 |
| 3.920707631679957 | 0.664 | 1 | 0.675 |
| 3.923849224333547 | 0.665 | 1 | 0.671 |
| 3.926990816987136 | 0.667 | 1 | 0.667 |
| 3.930132409640726 | 0.668 | 1 | 0.663 |
| 3.933274002294315 | 0.669 | 1 | 0.658 |
| 3.936415594947905 | 0.671 | 1 | 0.654 |
| 3.939557187601495 | 0.672 | 0.999 | 0.65 |
| 3.942698780255084 | 0.674 | 0.999 | 0.646 |
| 3.945840372908674 | 0.675 | 0.999 | 0.642 |
| 3.948981965562263 | 0.677 | 0.998 | 0.639 |
| 3.952123558215853 | 0.678 | 0.997 | 0.635 |
| 3.955265150869442 | 0.679 | 0.997 | 0.631 |
| 3.958406743523032 | 0.681 | 0.996 | 0.627 |
| 3.961548336176622 | 0.682 | 0.995 | 0.624 |
| 3.964689928830211 | 0.684 | 0.994 | 0.62 |
| 3.967831521483801 | 0.685 | 0.993 | 0.617 |
| 3.97097311413739 | 0.687 | 0.992 | 0.613 |
| 3.97411470679098 | 0.688 | 0.991 | 0.61 |
| 3.97725629944457 | 0.69 | 0.99 | 0.607 |
| 3.98039789209816 | 0.691 | 0.989 | 0.603 |
| 3.983539484751749 | 0.693 | 0.987 | 0.6 |
| 3.986681077405338 | 0.694 | 0.986 | 0.597 |
| 3.989822670058928 | 0.696 | 0.985 | 0.594 |
| 3.992964262712517 | 0.697 | 0.983 | 0.591 |
| 3.996105855366107 | 0.699 | 0.981 | 0.588 |
| 3.999247448019697 | 0.7 | 0.98 | 0.585 |
| 4.002389040673287 | 0.702 | 0.978 | 0.582 |
| 4.005530633326877 | 0.703 | 0.976 | 0.579 |
| 4.008672225980466 | 0.705 | 0.974 | 0.576 |
| 4.011813818634056 | 0.706 | 0.972 | 0.574 |
| 4.014955411287645 | 0.708 | 0.97 | 0.571 |
| 4.018097003941234 | 0.71 | 0.968 | 0.568 |
| 4.021238596594824 | 0.711 | 0.966 | 0.566 |
| 4.024380189248414 | 0.713 | 0.964 | 0.563 |
| 4.027521781902004 | 0.714 | 0.962 | 0.561 |
| 4.030663374555593 | 0.716 | 0.959 | 0.558 |
| 4.033804967209183 | 0.717 | 0.957 | 0.556 |
| 4.036946559862773 | 0.719 | 0.955 | 0.554 |
| 4.040088152516362 | 0.721 | 0.952 | 0.551 |
| 4.043229745169951 | 0.722 | 0.95 | 0.549 |
| 4.046371337823541 | 0.724 | 0.947 | 0.547 |
| 4.049512930477131 | 0.725 | 0.944 | 0.545 |
| 4.05265452313072 | 0.727 | 0.942 | 0.543 |
| 4.05579611578431 | 0.729 | 0.939 | 0.541 |
| 4.0589377084379 | 0.73 | 0.936 | 0.539 |
| 4.062079301091489 | 0.732 | 0.934 | 0.537 |
| 4.065220893745079 | 0.733 | 0.931 | 0.535 |
| 4.068362486398668 | 0.735 | 0.928 | 0.533 |
| 4.071504079052258 | 0.737 | 0.925 | 0.532 |
| 4.074645671705848 | 0.738 | 0.922 | 0.53 |
| 4.077787264359437 | 0.74 | 0.919 | 0.528 |
| 4.080928857013027 | 0.742 | 0.916 | 0.527 |
| 4.084070449666616 | 0.743 | 0.913 | 0.525 |
| 4.087212042320206 | 0.745 | 0.91 | 0.524 |
| 4.090353634973795 | 0.747 | 0.907 | 0.522 |
| 4.093495227627385 | 0.748 | 0.903 | 0.521 |
| 4.096636820280975 | 0.75 | 0.9 | 0.519 |
| 4.099778412934564 | 0.752 | 0.897 | 0.518 |
| 4.102920005588154 | 0.753 | 0.894 | 0.517 |
| 4.106061598241744 | 0.755 | 0.891 | 0.516 |
| 4.109203190895333 | 0.757 | 0.887 | 0.514 |
| 4.112344783548923 | 0.758 | 0.884 | 0.513 |
| 4.115486376202512 | 0.76 | 0.881 | 0.512 |
| 4.118627968856102 | 0.762 | 0.877 | 0.511 |
| 4.121769561509692 | 0.763 | 0.874 | 0.51 |
| 4.124911154163281 | 0.765 | 0.871 | 0.509 |
| 4.128052746816871 | 0.767 | 0.867 | 0.508 |
| 4.13119433947046 | 0.768 | 0.864 | 0.508 |
| 4.13433593212405 | 0.77 | 0.86 | 0.507 |
| 4.13747752477764 | 0.772 | 0.857 | 0.506 |
| 4.14061911743123 | 0.774 | 0.853 | 0.505 |
| 4.143760710084818 | 0.775 | 0.85 | 0.505 |
| 4.146902302738408 | 0.777 | 0.847 | 0.504 |
| 4.150043895391998 | 0.779 | 0.843 | 0.503 |
| 4.153185488045588 | 0.78 | 0.84 | 0.503 |
| 4.156327080699177 | 0.782 | 0.836 | 0.502 |
| 4.159468673352766 | 0.784 | 0.833 | 0.502 |
| 4.162610266006356 | 0.786 | 0.829 | 0.502 |
| 4.165751858659946 | 0.787 | 0.826 | 0.501 |
| 4.168893451313535 | 0.789 | 0.822 | 0.501 |
| 4.172035043967125 | 0.791 | 0.819 | 0.501 |
| 4.175176636620715 | 0.792 | 0.815 | 0.5 |
| 4.178318229274304 | 0.794 | 0.812 | 0.5 |
| 4.181459821927894 | 0.796 | 0.808 | 0.5 |
| 4.184601414581484 | 0.798 | 0.805 | 0.5 |
| 4.187743007235073 | 0.799 | 0.801 | 0.5 |
| 4.190884599888663 | 0.801 | 0.798 | 0.5 |
| 4.194026192542252 | 0.803 | 0.794 | 0.5 |
| 4.197167785195842 | 0.805 | 0.791 | 0.5 |
| 4.200309377849432 | 0.806 | 0.787 | 0.5 |
| 4.203450970503021 | 0.808 | 0.784 | 0.5 |
| 4.206592563156611 | 0.81 | 0.78 | 0.501 |
| 4.2097341558102 | 0.812 | 0.777 | 0.501 |
| 4.21287574846379 | 0.813 | 0.774 | 0.501 |
| 4.21601734111738 | 0.815 | 0.77 | 0.502 |
| 4.21915893377097 | 0.817 | 0.767 | 0.502 |
| 4.222300526424559 | 0.819 | 0.763 | 0.503 |
| 4.225442119078148 | 0.82 | 0.76 | 0.503 |
| 4.228583711731738 | 0.822 | 0.757 | 0.504 |
| 4.231725304385327 | 0.824 | 0.753 | 0.504 |
| 4.234866897038917 | 0.826 | 0.75 | 0.505 |
| 4.238008489692506 | 0.827 | 0.747 | 0.505 |
| 4.241150082346096 | 0.829 | 0.743 | 0.506 |
| 4.244291674999685 | 0.831 | 0.74 | 0.507 |
| 4.247433267653276 | 0.833 | 0.737 | 0.508 |
| 4.250574860306865 | 0.834 | 0.733 | 0.509 |
| 4.253716452960455 | 0.836 | 0.73 | 0.51 |
| 4.256858045614044 | 0.838 | 0.727 | 0.51 |
| 4.259999638267634 | 0.84 | 0.724 | 0.511 |
| 4.263141230921224 | 0.841 | 0.721 | 0.513 |
| 4.266282823574813 | 0.843 | 0.717 | 0.514 |
| 4.269424416228403 | 0.845 | 0.714 | 0.515 |
| 4.272566008881992 | 0.847 | 0.711 | 0.516 |
| 4.275707601535582 | 0.848 | 0.708 | 0.517 |
| 4.27884919418917 | 0.85 | 0.705 | 0.518 |
| 4.28199078684276 | 0.852 | 0.702 | 0.52 |
| 4.285132379496351 | 0.853 | 0.699 | 0.521 |
| 4.28827397214994 | 0.855 | 0.696 | 0.523 |
| 4.29141556480353 | 0.857 | 0.693 | 0.524 |
| 4.294557157457119 | 0.859 | 0.69 | 0.526 |
| 4.29769875011071 | 0.86 | 0.687 | 0.527 |
| 4.300840342764299 | 0.862 | 0.684 | 0.529 |
| 4.303981935417888 | 0.864 | 0.681 | 0.53 |
| 4.307123528071478 | 0.865 | 0.678 | 0.532 |
| 4.310265120725067 | 0.867 | 0.675 | 0.534 |
| 4.313406713378657 | 0.869 | 0.672 | 0.536 |
| 4.316548306032247 | 0.871 | 0.669 | 0.538 |
| 4.319689898685836 | 0.872 | 0.667 | 0.54 |
| 4.322831491339426 | 0.874 | 0.664 | 0.541 |
| 4.325973083993015 | 0.876 | 0.661 | 0.543 |
| 4.329114676646605 | 0.877 | 0.658 | 0.546 |
| 4.332256269300195 | 0.879 | 0.656 | 0.548 |
| 4.335397861953784 | 0.881 | 0.653 | 0.55 |
| 4.338539454607374 | 0.882 | 0.65 | 0.552 |
| 4.341681047260963 | 0.884 | 0.648 | 0.554 |
| 4.344822639914553 | 0.886 | 0.645 | 0.557 |
| 4.347964232568143 | 0.887 | 0.642 | 0.559 |
| 4.351105825221732 | 0.889 | 0.64 | 0.561 |
| 4.354247417875322 | 0.891 | 0.637 | 0.564 |
| 4.357389010528911 | 0.892 | 0.635 | 0.566 |
| 4.360530603182501 | 0.894 | 0.632 | 0.569 |
| 4.36367219583609 | 0.895 | 0.63 | 0.572 |
| 4.36681378848968 | 0.897 | 0.627 | 0.574 |
| 4.36995538114327 | 0.899 | 0.625 | 0.577 |
| 4.373096973796859 | 0.9 | 0.623 | 0.58 |
| 4.376238566450449 | 0.902 | 0.62 | 0.583 |
| 4.379380159104038 | 0.903 | 0.618 | 0.586 |
| 4.382521751757628 | 0.905 | 0.616 | 0.589 |
| 4.385663344411217 | 0.907 | 0.613 | 0.592 |
| 4.388804937064807 | 0.908 | 0.611 | 0.595 |
| 4.391946529718397 | 0.91 | 0.609 | 0.598 |
| 4.395088122371987 | 0.911 | 0.607 | 0.601 |
| 4.398229715025576 | 0.913 | 0.604 | 0.604 |
| 4.401371307679165 | 0.914 | 0.602 | 0.608 |
| 4.404512900332755 | 0.916 | 0.6 | 0.611 |
| 4.407654492986345 | 0.917 | 0.598 | 0.614 |
| 4.410796085639934 | 0.919 | 0.596 | 0.618 |
| 4.413937678293524 | 0.92 | 0.594 | 0.621 |
| 4.417079270947114 | 0.922 | 0.592 | 0.625 |
| 4.420220863600703 | 0.923 | 0.59 | 0.629 |
| 4.423362456254293 | 0.925 | 0.588 | 0.632 |
| 4.426504048907883 | 0.926 | 0.586 | 0.636 |
| 4.429645641561472 | 0.928 | 0.584 | 0.64 |
| 4.432787234215062 | 0.929 | 0.582 | 0.644 |
| 4.435928826868651 | 0.931 | 0.58 | 0.648 |
| 4.43907041952224 | 0.932 | 0.578 | 0.652 |
| 4.44221201217583 | 0.934 | 0.576 | 0.656 |
| 4.44535360482942 | 0.935 | 0.574 | 0.66 |
| 4.44849519748301 | 0.936 | 0.573 | 0.664 |
| 4.4516367901366 | 0.938 | 0.571 | 0.668 |
| 4.454778382790188 | 0.939 | 0.569 | 0.672 |
| 4.457919975443779 | 0.94 | 0.567 | 0.677 |
| 4.461061568097368 | 0.942 | 0.566 | 0.681 |
| 4.464203160750958 | 0.943 | 0.564 | 0.685 |
| 4.467344753404547 | 0.944 | 0.562 | 0.69 |
| 4.470486346058137 | 0.946 | 0.561 | 0.694 |
| 4.473627938711726 | 0.947 | 0.559 | 0.699 |
| 4.476769531365316 | 0.948 | 0.557 | 0.703 |
| 4.479911124018905 | 0.95 | 0.556 | 0.708 |
| 4.483052716672495 | 0.951 | 0.554 | 0.713 |
| 4.486194309326085 | 0.952 | 0.553 | 0.717 |
| 4.489335901979674 | 0.953 | 0.551 | 0.722 |
| 4.492477494633264 | 0.955 | 0.55 | 0.727 |
| 4.495619087286854 | 0.956 | 0.548 | 0.732 |
| 4.498760679940443 | 0.957 | 0.547 | 0.737 |
| 4.501902272594033 | 0.958 | 0.546 | 0.742 |
| 4.505043865247622 | 0.959 | 0.544 | 0.747 |
| 4.508185457901212 | 0.961 | 0.543 | 0.752 |
| 4.511327050554801 | 0.962 | 0.541 | 0.757 |
| 4.514468643208391 | 0.963 | 0.54 | 0.762 |
| 4.517610235861981 | 0.964 | 0.539 | 0.767 |
| 4.520751828515571 | 0.965 | 0.538 | 0.772 |
| 4.52389342116916 | 0.966 | 0.536 | 0.777 |
| 4.52703501382275 | 0.967 | 0.535 | 0.782 |
| 4.530176606476339 | 0.968 | 0.534 | 0.787 |
| 4.533318199129928 | 0.969 | 0.533 | 0.792 |
| 4.536459791783518 | 0.97 | 0.532 | 0.798 |
| 4.539601384437108 | 0.971 | 0.53 | 0.803 |
| 4.542742977090698 | 0.972 | 0.529 | 0.808 |
| 4.545884569744287 | 0.973 | 0.528 | 0.813 |
| 4.549026162397876 | 0.974 | 0.527 | 0.819 |
| 4.552167755051466 | 0.975 | 0.526 | 0.824 |
| 4.555309347705056 | 0.976 | 0.525 | 0.829 |
| 4.558450940358646 | 0.977 | 0.524 | 0.834 |
| 4.561592533012235 | 0.978 | 0.523 | 0.84 |
| 4.564734125665825 | 0.979 | 0.522 | 0.845 |
| 4.567875718319415 | 0.98 | 0.521 | 0.85 |
| 4.571017310973004 | 0.981 | 0.52 | 0.855 |
| 4.574158903626594 | 0.981 | 0.519 | 0.86 |
| 4.577300496280183 | 0.982 | 0.518 | 0.865 |
| 4.580442088933772 | 0.983 | 0.518 | 0.871 |
| 4.583583681587362 | 0.984 | 0.517 | 0.876 |
| 4.586725274240952 | 0.985 | 0.516 | 0.881 |
| 4.589866866894542 | 0.985 | 0.515 | 0.886 |
| 4.593008459548131 | 0.986 | 0.514 | 0.891 |
| 4.596150052201721 | 0.987 | 0.514 | 0.895 |
| 4.59929164485531 | 0.987 | 0.513 | 0.9 |
| 4.6024332375089 | 0.988 | 0.512 | 0.905 |
| 4.60557483016249 | 0.989 | 0.511 | 0.91 |
| 4.608716422816079 | 0.989 | 0.511 | 0.914 |
| 4.611858015469668 | 0.99 | 0.51 | 0.919 |
| 4.614999608123258 | 0.991 | 0.51 | 0.923 |
| 4.618141200776848 | 0.991 | 0.509 | 0.928 |
| 4.621282793430437 | 0.992 | 0.508 | 0.932 |
| 4.624424386084027 | 0.992 | 0.508 | 0.936 |
| 4.627565978737617 | 0.993 | 0.507 | 0.94 |
| 4.630707571391206 | 0.993 | 0.507 | 0.944 |
| 4.633849164044795 | 0.994 | 0.506 | 0.948 |
| 4.636990756698386 | 0.994 | 0.506 | 0.952 |
| 4.640132349351975 | 0.995 | 0.505 | 0.956 |
| 4.643273942005564 | 0.995 | 0.505 | 0.959 |
| 4.646415534659154 | 0.996 | 0.504 | 0.963 |
| 4.649557127312744 | 0.996 | 0.504 | 0.966 |
| 4.652698719966334 | 0.996 | 0.504 | 0.969 |
| 4.655840312619923 | 0.997 | 0.503 | 0.972 |
| 4.658981905273513 | 0.997 | 0.503 | 0.975 |
| 4.662123497927102 | 0.997 | 0.503 | 0.978 |
| 4.665265090580692 | 0.998 | 0.502 | 0.981 |
| 4.668406683234282 | 0.998 | 0.502 | 0.983 |
| 4.671548275887871 | 0.998 | 0.502 | 0.985 |
| 4.674689868541461 | 0.999 | 0.501 | 0.987 |
| 4.67783146119505 | 0.999 | 0.501 | 0.989 |
| 4.68097305384864 | 0.999 | 0.501 | 0.991 |
| 4.68411464650223 | 0.999 | 0.501 | 0.993 |
| 4.687256239155819 | 0.999 | 0.501 | 0.994 |
| 4.690397831809409 | 1 | 0.5 | 0.996 |
| 4.693539424462998 | 1 | 0.5 | 0.997 |
| 4.696681017116588 | 1 | 0.5 | 0.998 |
| 4.699822609770177 | 1 | 0.5 | 0.999 |
| 4.702964202423767 | 1 | 0.5 | 0.999 |
| 4.706105795077356 | 1 | 0.5 | 1 |
| 4.709247387730946 | 1 | 0.5 | 1 |
| 4.712388980384535 | 1 | 0.5 | 1 |
| 4.715530573038126 | 1 | 0.5 | 1 |
| 4.718672165691715 | 1 | 0.5 | 1 |
| 4.721813758345305 | 1 | 0.5 | 0.999 |
| 4.724955350998894 | 1 | 0.5 | 0.999 |
| 4.728096943652484 | 1 | 0.5 | 0.998 |
| 4.731238536306074 | 1 | 0.5 | 0.997 |
| 4.734380128959663 | 1 | 0.5 | 0.996 |
| 4.737521721613253 | 0.999 | 0.501 | 0.994 |
| 4.740663314266842 | 0.999 | 0.501 | 0.993 |
| 4.743804906920432 | 0.999 | 0.501 | 0.991 |
| 4.74694649957402 | 0.999 | 0.501 | 0.989 |
| 4.750088092227611 | 0.999 | 0.501 | 0.987 |
| 4.7532296848812 | 0.998 | 0.502 | 0.985 |
| 4.75637127753479 | 0.998 | 0.502 | 0.983 |
| 4.75951287018838 | 0.998 | 0.502 | 0.981 |
| 4.76265446284197 | 0.997 | 0.503 | 0.978 |
| 4.765796055495559 | 0.997 | 0.503 | 0.975 |
| 4.768937648149149 | 0.997 | 0.503 | 0.972 |
| 4.772079240802738 | 0.996 | 0.504 | 0.969 |
| 4.775220833456327 | 0.996 | 0.504 | 0.966 |
| 4.778362426109917 | 0.996 | 0.504 | 0.963 |
| 4.781504018763507 | 0.995 | 0.505 | 0.959 |
| 4.784645611417097 | 0.995 | 0.505 | 0.956 |
| 4.787787204070686 | 0.994 | 0.506 | 0.952 |
| 4.790928796724275 | 0.994 | 0.506 | 0.948 |
| 4.794070389377865 | 0.993 | 0.507 | 0.944 |
| 4.797211982031455 | 0.993 | 0.507 | 0.94 |
| 4.800353574685045 | 0.992 | 0.508 | 0.936 |
| 4.803495167338634 | 0.992 | 0.508 | 0.932 |
| 4.806636759992224 | 0.991 | 0.509 | 0.928 |
| 4.809778352645814 | 0.991 | 0.51 | 0.923 |
| 4.812919945299403 | 0.99 | 0.51 | 0.919 |
| 4.816061537952993 | 0.989 | 0.511 | 0.914 |
| 4.819203130606582 | 0.989 | 0.511 | 0.91 |
| 4.822344723260172 | 0.988 | 0.512 | 0.905 |
| 4.825486315913761 | 0.987 | 0.513 | 0.9 |
| 4.828627908567351 | 0.987 | 0.514 | 0.895 |
| 4.83176950122094 | 0.986 | 0.514 | 0.891 |
| 4.83491109387453 | 0.985 | 0.515 | 0.886 |
| 4.83805268652812 | 0.985 | 0.516 | 0.881 |
| 4.841194279181709 | 0.984 | 0.517 | 0.876 |
| 4.844335871835299 | 0.983 | 0.518 | 0.871 |
| 4.847477464488889 | 0.982 | 0.518 | 0.865 |
| 4.850619057142478 | 0.981 | 0.519 | 0.86 |
| 4.853760649796068 | 0.981 | 0.52 | 0.855 |
| 4.856902242449657 | 0.98 | 0.521 | 0.85 |
| 4.860043835103247 | 0.979 | 0.522 | 0.845 |
| 4.863185427756837 | 0.978 | 0.523 | 0.84 |
| 4.866327020410426 | 0.977 | 0.524 | 0.834 |
| 4.869468613064015 | 0.976 | 0.525 | 0.829 |
| 4.872610205717605 | 0.975 | 0.526 | 0.824 |
| 4.875751798371195 | 0.974 | 0.527 | 0.819 |
| 4.878893391024784 | 0.973 | 0.528 | 0.813 |
| 4.882034983678374 | 0.972 | 0.529 | 0.808 |
| 4.885176576331964 | 0.971 | 0.53 | 0.803 |
| 4.888318168985553 | 0.97 | 0.532 | 0.798 |
| 4.891459761639143 | 0.969 | 0.533 | 0.792 |
| 4.894601354292733 | 0.968 | 0.534 | 0.787 |
| 4.897742946946322 | 0.967 | 0.535 | 0.782 |
| 4.900884539599912 | 0.966 | 0.536 | 0.777 |
| 4.904026132253501 | 0.965 | 0.538 | 0.772 |
| 4.907167724907091 | 0.964 | 0.539 | 0.767 |
| 4.91030931756068 | 0.963 | 0.54 | 0.762 |
| 4.91345091021427 | 0.962 | 0.541 | 0.757 |
| 4.91659250286786 | 0.961 | 0.543 | 0.752 |
| 4.91973409552145 | 0.959 | 0.544 | 0.747 |
| 4.922875688175039 | 0.958 | 0.546 | 0.742 |
| 4.926017280828628 | 0.957 | 0.547 | 0.737 |
| 4.929158873482218 | 0.956 | 0.548 | 0.732 |
| 4.932300466135808 | 0.955 | 0.55 | 0.727 |
| 4.935442058789397 | 0.953 | 0.551 | 0.722 |
| 4.938583651442987 | 0.952 | 0.553 | 0.717 |
| 4.941725244096576 | 0.951 | 0.554 | 0.713 |
| 4.944866836750166 | 0.95 | 0.556 | 0.708 |
| 4.948008429403755 | 0.948 | 0.557 | 0.703 |
| 4.951150022057345 | 0.947 | 0.559 | 0.699 |
| 4.954291614710935 | 0.946 | 0.561 | 0.694 |
| 4.957433207364524 | 0.944 | 0.562 | 0.69 |
| 4.960574800018114 | 0.943 | 0.564 | 0.685 |
| 4.963716392671704 | 0.942 | 0.566 | 0.681 |
| 4.966857985325293 | 0.94 | 0.567 | 0.677 |
| 4.969999577978883 | 0.939 | 0.569 | 0.672 |
| 4.973141170632472 | 0.938 | 0.571 | 0.668 |
| 4.976282763286062 | 0.936 | 0.573 | 0.664 |
| 4.979424355939651 | 0.935 | 0.574 | 0.66 |
| 4.982565948593241 | 0.934 | 0.576 | 0.656 |
| 4.985707541246831 | 0.932 | 0.578 | 0.652 |
| 4.98884913390042 | 0.931 | 0.58 | 0.648 |
| 4.99199072655401 | 0.929 | 0.582 | 0.644 |
| 4.9951323192076 | 0.928 | 0.584 | 0.64 |
| 4.99827391186119 | 0.926 | 0.586 | 0.636 |
| 5.00141550451478 | 0.925 | 0.588 | 0.632 |
| 5.004557097168369 | 0.923 | 0.59 | 0.629 |
| 5.007698689821958 | 0.922 | 0.592 | 0.625 |
| 5.010840282475548 | 0.92 | 0.594 | 0.621 |
| 5.013981875129137 | 0.919 | 0.596 | 0.618 |
| 5.017123467782727 | 0.917 | 0.598 | 0.614 |
| 5.020265060436317 | 0.916 | 0.6 | 0.611 |
| 5.023406653089906 | 0.914 | 0.602 | 0.608 |
| 5.026548245743496 | 0.913 | 0.604 | 0.604 |
| 5.029689838397085 | 0.911 | 0.607 | 0.601 |
| 5.032831431050674 | 0.91 | 0.609 | 0.598 |
| 5.035973023704264 | 0.908 | 0.611 | 0.595 |
| 5.039114616357854 | 0.907 | 0.613 | 0.592 |
| 5.042256209011444 | 0.905 | 0.616 | 0.589 |
| 5.045397801665033 | 0.903 | 0.618 | 0.586 |
| 5.048539394318622 | 0.902 | 0.62 | 0.583 |
| 5.051680986972213 | 0.9 | 0.623 | 0.58 |
| 5.054822579625802 | 0.899 | 0.625 | 0.577 |
| 5.057964172279392 | 0.897 | 0.627 | 0.574 |
| 5.061105764932981 | 0.895 | 0.63 | 0.572 |
| 5.064247357586571 | 0.894 | 0.632 | 0.569 |
| 5.067388950240161 | 0.892 | 0.635 | 0.566 |
| 5.07053054289375 | 0.891 | 0.637 | 0.564 |
| 5.07367213554734 | 0.889 | 0.64 | 0.561 |
| 5.07681372820093 | 0.887 | 0.642 | 0.559 |
| 5.079955320854519 | 0.886 | 0.645 | 0.557 |
| 5.083096913508108 | 0.884 | 0.648 | 0.554 |
| 5.086238506161698 | 0.882 | 0.65 | 0.552 |
| 5.089380098815288 | 0.881 | 0.653 | 0.55 |
| 5.092521691468877 | 0.879 | 0.656 | 0.548 |
| 5.095663284122466 | 0.877 | 0.658 | 0.546 |
| 5.098804876776057 | 0.876 | 0.661 | 0.543 |
| 5.101946469429646 | 0.874 | 0.664 | 0.541 |
| 5.105088062083236 | 0.872 | 0.667 | 0.54 |
| 5.108229654736825 | 0.871 | 0.669 | 0.538 |
| 5.111371247390415 | 0.869 | 0.672 | 0.536 |
| 5.114512840044005 | 0.867 | 0.675 | 0.534 |
| 5.117654432697594 | 0.865 | 0.678 | 0.532 |
| 5.120796025351184 | 0.864 | 0.681 | 0.53 |
| 5.123937618004773 | 0.862 | 0.684 | 0.529 |
| 5.127079210658363 | 0.86 | 0.687 | 0.527 |
| 5.130220803311953 | 0.859 | 0.69 | 0.526 |
| 5.133362395965542 | 0.857 | 0.693 | 0.524 |
| 5.136503988619131 | 0.855 | 0.696 | 0.523 |
| 5.13964558127272 | 0.853 | 0.699 | 0.521 |
| 5.142787173926311 | 0.852 | 0.702 | 0.52 |
| 5.1459287665799 | 0.85 | 0.705 | 0.518 |
| 5.14907035923349 | 0.848 | 0.708 | 0.517 |
| 5.15221195188708 | 0.847 | 0.711 | 0.516 |
| 5.15535354454067 | 0.845 | 0.714 | 0.515 |
| 5.158495137194259 | 0.843 | 0.717 | 0.514 |
| 5.161636729847848 | 0.841 | 0.721 | 0.513 |
| 5.164778322501438 | 0.84 | 0.724 | 0.511 |
| 5.167919915155028 | 0.838 | 0.727 | 0.51 |
| 5.171061507808617 | 0.836 | 0.73 | 0.51 |
| 5.174203100462206 | 0.834 | 0.733 | 0.509 |
| 5.177344693115796 | 0.833 | 0.737 | 0.508 |
| 5.180486285769386 | 0.831 | 0.74 | 0.507 |
| 5.183627878422976 | 0.829 | 0.743 | 0.506 |
| 5.186769471076565 | 0.827 | 0.747 | 0.505 |
| 5.189911063730155 | 0.826 | 0.75 | 0.505 |
| 5.193052656383744 | 0.824 | 0.753 | 0.504 |
| 5.196194249037334 | 0.822 | 0.757 | 0.504 |
| 5.199335841690924 | 0.82 | 0.76 | 0.503 |
| 5.202477434344513 | 0.819 | 0.763 | 0.503 |
| 5.205619026998103 | 0.817 | 0.767 | 0.502 |
| 5.208760619651692 | 0.815 | 0.77 | 0.502 |
| 5.211902212305282 | 0.813 | 0.774 | 0.501 |
| 5.215043804958871 | 0.812 | 0.777 | 0.501 |
| 5.218185397612461 | 0.81 | 0.78 | 0.501 |
| 5.221326990266051 | 0.808 | 0.784 | 0.5 |
| 5.22446858291964 | 0.806 | 0.787 | 0.5 |
| 5.22761017557323 | 0.805 | 0.791 | 0.5 |
| 5.23075176822682 | 0.803 | 0.794 | 0.5 |
| 5.23389336088041 | 0.801 | 0.798 | 0.5 |
| 5.237034953533999 | 0.799 | 0.801 | 0.5 |
| 5.240176546187588 | 0.798 | 0.805 | 0.5 |
| 5.243318138841178 | 0.796 | 0.808 | 0.5 |
| 5.246459731494767 | 0.794 | 0.812 | 0.5 |
| 5.249601324148357 | 0.792 | 0.815 | 0.5 |
| 5.252742916801947 | 0.791 | 0.819 | 0.501 |
| 5.255884509455536 | 0.789 | 0.822 | 0.501 |
| 5.259026102109125 | 0.787 | 0.826 | 0.501 |
| 5.262167694762715 | 0.786 | 0.829 | 0.502 |
| 5.265309287416305 | 0.784 | 0.833 | 0.502 |
| 5.268450880069895 | 0.782 | 0.836 | 0.502 |
| 5.271592472723484 | 0.78 | 0.84 | 0.503 |
| 5.274734065377074 | 0.779 | 0.843 | 0.503 |
| 5.277875658030664 | 0.777 | 0.847 | 0.504 |
| 5.281017250684253 | 0.775 | 0.85 | 0.505 |
| 5.284158843337843 | 0.774 | 0.853 | 0.505 |
| 5.287300435991432 | 0.772 | 0.857 | 0.506 |
| 5.290442028645022 | 0.77 | 0.86 | 0.507 |
| 5.293583621298612 | 0.768 | 0.864 | 0.508 |
| 5.296725213952201 | 0.767 | 0.867 | 0.508 |
| 5.299866806605791 | 0.765 | 0.871 | 0.509 |
| 5.30300839925938 | 0.763 | 0.874 | 0.51 |
| 5.30614999191297 | 0.762 | 0.877 | 0.511 |
| 5.30929158456656 | 0.76 | 0.881 | 0.512 |
| 5.312433177220149 | 0.758 | 0.884 | 0.513 |
| 5.315574769873739 | 0.757 | 0.887 | 0.514 |
| 5.318716362527328 | 0.755 | 0.891 | 0.516 |
| 5.321857955180918 | 0.753 | 0.894 | 0.517 |
| 5.324999547834508 | 0.752 | 0.897 | 0.518 |
| 5.328141140488097 | 0.75 | 0.9 | 0.519 |
| 5.331282733141686 | 0.748 | 0.903 | 0.521 |
| 5.334424325795276 | 0.747 | 0.907 | 0.522 |
| 5.337565918448866 | 0.745 | 0.91 | 0.524 |
| 5.340707511102456 | 0.743 | 0.913 | 0.525 |
| 5.343849103756045 | 0.742 | 0.916 | 0.527 |
| 5.346990696409634 | 0.74 | 0.919 | 0.528 |
| 5.350132289063224 | 0.738 | 0.922 | 0.53 |
| 5.353273881716814 | 0.737 | 0.925 | 0.532 |
| 5.356415474370403 | 0.735 | 0.928 | 0.533 |
| 5.359557067023993 | 0.733 | 0.931 | 0.535 |
| 5.362698659677583 | 0.732 | 0.934 | 0.537 |
| 5.365840252331172 | 0.73 | 0.936 | 0.539 |
| 5.368981844984762 | 0.729 | 0.939 | 0.541 |
| 5.372123437638351 | 0.727 | 0.942 | 0.543 |
| 5.375265030291941 | 0.725 | 0.944 | 0.545 |
| 5.378406622945531 | 0.724 | 0.947 | 0.547 |
| 5.38154821559912 | 0.722 | 0.95 | 0.549 |
| 5.38468980825271 | 0.721 | 0.952 | 0.551 |
| 5.387831400906299 | 0.719 | 0.955 | 0.554 |
| 5.39097299355989 | 0.717 | 0.957 | 0.556 |
| 5.394114586213479 | 0.716 | 0.959 | 0.558 |
| 5.397256178867068 | 0.714 | 0.962 | 0.561 |
| 5.400397771520657 | 0.713 | 0.964 | 0.563 |
| 5.403539364174247 | 0.711 | 0.966 | 0.566 |
| 5.406680956827837 | 0.71 | 0.968 | 0.568 |
| 5.409822549481426 | 0.708 | 0.97 | 0.571 |
| 5.412964142135016 | 0.706 | 0.972 | 0.574 |
| 5.416105734788605 | 0.705 | 0.974 | 0.576 |
| 5.419247327442195 | 0.703 | 0.976 | 0.579 |
| 5.422388920095785 | 0.702 | 0.978 | 0.582 |
| 5.425530512749375 | 0.7 | 0.98 | 0.585 |
| 5.428672105402964 | 0.699 | 0.981 | 0.588 |
| 5.431813698056554 | 0.697 | 0.983 | 0.591 |
| 5.434955290710143 | 0.696 | 0.985 | 0.594 |
| 5.438096883363733 | 0.694 | 0.986 | 0.597 |
| 5.441238476017322 | 0.693 | 0.987 | 0.6 |
| 5.444380068670912 | 0.691 | 0.989 | 0.603 |
| 5.447521661324502 | 0.69 | 0.99 | 0.607 |
| 5.450663253978091 | 0.688 | 0.991 | 0.61 |
| 5.453804846631681 | 0.687 | 0.992 | 0.613 |
| 5.456946439285271 | 0.685 | 0.993 | 0.617 |
| 5.46008803193886 | 0.684 | 0.994 | 0.62 |
| 5.46322962459245 | 0.682 | 0.995 | 0.624 |
| 5.466371217246039 | 0.681 | 0.996 | 0.627 |
| 5.46951280989963 | 0.679 | 0.997 | 0.631 |
| 5.472654402553218 | 0.678 | 0.997 | 0.635 |
| 5.475795995206808 | 0.677 | 0.998 | 0.639 |
| 5.478937587860398 | 0.675 | 0.999 | 0.642 |
| 5.482079180513987 | 0.674 | 0.999 | 0.646 |
| 5.485220773167577 | 0.672 | 0.999 | 0.65 |
| 5.488362365821166 | 0.671 | 1 | 0.654 |
| 5.491503958474756 | 0.669 | 1 | 0.658 |
| 5.494645551128346 | 0.668 | 1 | 0.663 |
| 5.497787143781935 | 0.667 | 1 | 0.667 |
| 5.500928736435525 | 0.665 | 1 | 0.671 |
| 5.504070329089115 | 0.664 | 1 | 0.675 |
| 5.507211921742704 | 0.663 | 1 | 0.679 |
| 5.510353514396294 | 0.661 | 0.999 | 0.684 |
| 5.513495107049883 | 0.66 | 0.999 | 0.688 |
| 5.516636699703473 | 0.658 | 0.999 | 0.693 |
| 5.519778292357062 | 0.657 | 0.998 | 0.697 |
| 5.522919885010652 | 0.656 | 0.997 | 0.702 |
| 5.526061477664242 | 0.654 | 0.997 | 0.706 |
| 5.529203070317831 | 0.653 | 0.996 | 0.711 |
| 5.532344662971421 | 0.652 | 0.995 | 0.716 |
| 5.535486255625011 | 0.65 | 0.994 | 0.721 |
| 5.5386278482786 | 0.649 | 0.993 | 0.725 |
| 5.54176944093219 | 0.648 | 0.992 | 0.73 |
| 5.544911033585779 | 0.646 | 0.991 | 0.735 |
| 5.54805262623937 | 0.645 | 0.99 | 0.74 |
| 5.551194218892959 | 0.644 | 0.989 | 0.745 |
| 5.554335811546548 | 0.642 | 0.987 | 0.75 |
| 5.557477404200137 | 0.641 | 0.986 | 0.755 |
| 5.560618996853727 | 0.64 | 0.985 | 0.76 |
| 5.563760589507317 | 0.639 | 0.983 | 0.765 |
| 5.566902182160906 | 0.637 | 0.981 | 0.77 |
| 5.570043774814496 | 0.636 | 0.98 | 0.775 |
| 5.573185367468086 | 0.635 | 0.978 | 0.78 |
| 5.576326960121675 | 0.634 | 0.976 | 0.786 |
| 5.579468552775264 | 0.632 | 0.974 | 0.791 |
| 5.582610145428854 | 0.631 | 0.972 | 0.796 |
| 5.585751738082444 | 0.63 | 0.97 | 0.801 |
| 5.588893330736034 | 0.629 | 0.968 | 0.806 |
| 5.592034923389623 | 0.627 | 0.966 | 0.812 |
| 5.595176516043213 | 0.626 | 0.964 | 0.817 |
| 5.598318108696803 | 0.625 | 0.962 | 0.822 |
| 5.601459701350392 | 0.624 | 0.959 | 0.827 |
| 5.604601294003982 | 0.623 | 0.957 | 0.833 |
| 5.607742886657571 | 0.621 | 0.955 | 0.838 |
| 5.610884479311161 | 0.62 | 0.952 | 0.843 |
| 5.61402607196475 | 0.619 | 0.95 | 0.848 |
| 5.61716766461834 | 0.618 | 0.947 | 0.853 |
| 5.62030925727193 | 0.617 | 0.944 | 0.859 |
| 5.623450849925519 | 0.616 | 0.942 | 0.864 |
| 5.626592442579109 | 0.614 | 0.939 | 0.869 |
| 5.629734035232698 | 0.613 | 0.936 | 0.874 |
| 5.632875627886288 | 0.612 | 0.934 | 0.879 |
| 5.636017220539878 | 0.611 | 0.931 | 0.884 |
| 5.639158813193467 | 0.61 | 0.928 | 0.889 |
| 5.642300405847057 | 0.609 | 0.925 | 0.894 |
| 5.645441998500646 | 0.608 | 0.922 | 0.899 |
| 5.648583591154236 | 0.607 | 0.919 | 0.903 |
| 5.651725183807825 | 0.606 | 0.916 | 0.908 |
| 5.654866776461415 | 0.604 | 0.913 | 0.913 |
| 5.658008369115005 | 0.603 | 0.91 | 0.917 |
| 5.661149961768594 | 0.602 | 0.907 | 0.922 |
| 5.664291554422184 | 0.601 | 0.903 | 0.926 |
| 5.667433147075774 | 0.6 | 0.9 | 0.931 |
| 5.670574739729363 | 0.599 | 0.897 | 0.935 |
| 5.673716332382953 | 0.598 | 0.894 | 0.939 |
| 5.676857925036542 | 0.597 | 0.891 | 0.943 |
| 5.679999517690132 | 0.596 | 0.887 | 0.947 |
| 5.683141110343721 | 0.595 | 0.884 | 0.951 |
| 5.686282702997311 | 0.594 | 0.881 | 0.955 |
| 5.689424295650901 | 0.593 | 0.877 | 0.958 |
| 5.69256588830449 | 0.592 | 0.874 | 0.962 |
| 5.69570748095808 | 0.591 | 0.871 | 0.965 |
| 5.69884907361167 | 0.59 | 0.867 | 0.968 |
| 5.701990666265259 | 0.589 | 0.864 | 0.971 |
| 5.705132258918849 | 0.588 | 0.86 | 0.974 |
| 5.708273851572438 | 0.587 | 0.857 | 0.977 |
| 5.711415444226028 | 0.586 | 0.853 | 0.98 |
| 5.714557036879618 | 0.585 | 0.85 | 0.982 |
| 5.717698629533207 | 0.584 | 0.847 | 0.985 |
| 5.720840222186797 | 0.583 | 0.843 | 0.987 |
| 5.723981814840386 | 0.582 | 0.84 | 0.989 |
| 5.727123407493976 | 0.581 | 0.836 | 0.991 |
| 5.730265000147565 | 0.58 | 0.833 | 0.992 |
| 5.733406592801155 | 0.579 | 0.829 | 0.994 |
| 5.736548185454744 | 0.578 | 0.826 | 0.995 |
| 5.739689778108334 | 0.577 | 0.822 | 0.996 |
| 5.742831370761924 | 0.576 | 0.819 | 0.997 |
| 5.745972963415514 | 0.575 | 0.815 | 0.998 |
| 5.749114556069103 | 0.574 | 0.812 | 0.999 |
| 5.752256148722693 | 0.574 | 0.808 | 1 |
| 5.755397741376282 | 0.573 | 0.805 | 1 |
| 5.758539334029872 | 0.572 | 0.801 | 1 |
| 5.761680926683462 | 0.571 | 0.798 | 1 |
| 5.764822519337051 | 0.57 | 0.794 | 1 |
| 5.767964111990641 | 0.569 | 0.791 | 0.999 |
| 5.77110570464423 | 0.568 | 0.787 | 0.999 |
| 5.77424729729782 | 0.567 | 0.784 | 0.998 |
| 5.77738888995141 | 0.566 | 0.78 | 0.997 |
| 5.780530482605 | 0.566 | 0.777 | 0.996 |
| 5.783672075258588 | 0.565 | 0.774 | 0.995 |
| 5.786813667912178 | 0.564 | 0.77 | 0.993 |
| 5.789955260565768 | 0.563 | 0.767 | 0.992 |
| 5.793096853219358 | 0.562 | 0.763 | 0.99 |
| 5.796238445872947 | 0.561 | 0.76 | 0.988 |
| 5.799380038526537 | 0.561 | 0.757 | 0.986 |
| 5.802521631180126 | 0.56 | 0.753 | 0.984 |
| 5.805663223833715 | 0.559 | 0.75 | 0.981 |
| 5.808804816487306 | 0.558 | 0.747 | 0.979 |
| 5.811946409140895 | 0.557 | 0.743 | 0.976 |
| 5.815088001794485 | 0.557 | 0.74 | 0.973 |
| 5.818229594448074 | 0.556 | 0.737 | 0.97 |
| 5.821371187101663 | 0.555 | 0.733 | 0.967 |
| 5.824512779755254 | 0.554 | 0.73 | 0.964 |
| 5.827654372408843 | 0.554 | 0.727 | 0.961 |
| 5.830795965062433 | 0.553 | 0.724 | 0.957 |
| 5.833937557716022 | 0.552 | 0.721 | 0.953 |
| 5.837079150369612 | 0.551 | 0.717 | 0.95 |
| 5.840220743023201 | 0.551 | 0.714 | 0.946 |
| 5.843362335676791 | 0.55 | 0.711 | 0.942 |
| 5.846503928330381 | 0.549 | 0.708 | 0.938 |
| 5.84964552098397 | 0.548 | 0.705 | 0.934 |
| 5.85278711363756 | 0.548 | 0.702 | 0.929 |
| 5.85592870629115 | 0.547 | 0.699 | 0.925 |
| 5.85907029894474 | 0.546 | 0.696 | 0.92 |
| 5.862211891598329 | 0.546 | 0.693 | 0.916 |
| 5.865353484251918 | 0.545 | 0.69 | 0.911 |
| 5.868495076905508 | 0.544 | 0.687 | 0.907 |
| 5.871636669559098 | 0.543 | 0.684 | 0.902 |
| 5.874778262212687 | 0.543 | 0.681 | 0.897 |
| 5.877919854866277 | 0.542 | 0.678 | 0.892 |
| 5.881061447519866 | 0.541 | 0.675 | 0.887 |
| 5.884203040173456 | 0.541 | 0.672 | 0.882 |
| 5.887344632827046 | 0.54 | 0.669 | 0.877 |
| 5.890486225480635 | 0.54 | 0.667 | 0.872 |
| 5.893627818134224 | 0.539 | 0.664 | 0.867 |
| 5.896769410787814 | 0.538 | 0.661 | 0.862 |
| 5.899911003441404 | 0.538 | 0.658 | 0.857 |
| 5.903052596094994 | 0.537 | 0.656 | 0.852 |
| 5.906194188748583 | 0.536 | 0.653 | 0.847 |
| 5.909335781402172 | 0.536 | 0.65 | 0.841 |
| 5.912477374055762 | 0.535 | 0.648 | 0.836 |
| 5.915618966709352 | 0.535 | 0.645 | 0.831 |
| 5.918760559362942 | 0.534 | 0.642 | 0.826 |
| 5.921902152016531 | 0.533 | 0.64 | 0.82 |
| 5.92504374467012 | 0.533 | 0.637 | 0.815 |
| 5.92818533732371 | 0.532 | 0.635 | 0.81 |
| 5.9313269299773 | 0.532 | 0.632 | 0.805 |
| 5.93446852263089 | 0.531 | 0.63 | 0.799 |
| 5.93761011528448 | 0.53 | 0.627 | 0.794 |
| 5.940751707938068 | 0.53 | 0.625 | 0.789 |
| 5.943893300591658 | 0.529 | 0.623 | 0.784 |
| 5.947034893245248 | 0.529 | 0.62 | 0.779 |
| 5.950176485898837 | 0.528 | 0.618 | 0.774 |
| 5.953318078552427 | 0.528 | 0.616 | 0.768 |
| 5.956459671206017 | 0.527 | 0.613 | 0.763 |
| 5.959601263859606 | 0.527 | 0.611 | 0.758 |
| 5.962742856513196 | 0.526 | 0.609 | 0.753 |
| 5.965884449166785 | 0.526 | 0.607 | 0.748 |
| 5.969026041820375 | 0.525 | 0.604 | 0.743 |
| 5.972167634473964 | 0.525 | 0.602 | 0.738 |
| 5.975309227127554 | 0.524 | 0.6 | 0.733 |
| 5.978450819781144 | 0.524 | 0.598 | 0.729 |
| 5.981592412434733 | 0.523 | 0.596 | 0.724 |
| 5.984734005088323 | 0.523 | 0.594 | 0.719 |
| 5.987875597741913 | 0.522 | 0.592 | 0.714 |
| 5.991017190395502 | 0.522 | 0.59 | 0.71 |
| 5.994158783049092 | 0.521 | 0.588 | 0.705 |
| 5.997300375702681 | 0.521 | 0.586 | 0.7 |
| 6.000441968356271 | 0.52 | 0.584 | 0.696 |
| 6.003583561009861 | 0.52 | 0.582 | 0.691 |
| 6.00672515366345 | 0.519 | 0.58 | 0.687 |
| 6.00986674631704 | 0.519 | 0.578 | 0.682 |
| 6.01300833897063 | 0.518 | 0.576 | 0.678 |
| 6.01614993162422 | 0.518 | 0.574 | 0.674 |
| 6.019291524277808 | 0.518 | 0.573 | 0.669 |
| 6.022433116931398 | 0.517 | 0.571 | 0.665 |
| 6.025574709584988 | 0.517 | 0.569 | 0.661 |
| 6.028716302238577 | 0.516 | 0.567 | 0.657 |
| 6.031857894892167 | 0.516 | 0.566 | 0.653 |
| 6.034999487545757 | 0.516 | 0.564 | 0.649 |
| 6.038141080199346 | 0.515 | 0.562 | 0.645 |
| 6.041282672852935 | 0.515 | 0.561 | 0.641 |
| 6.044424265506525 | 0.514 | 0.559 | 0.637 |
| 6.047565858160115 | 0.514 | 0.557 | 0.634 |
| 6.050707450813704 | 0.514 | 0.556 | 0.63 |
| 6.053849043467294 | 0.513 | 0.554 | 0.626 |
| 6.056990636120884 | 0.513 | 0.553 | 0.623 |
| 6.060132228774473 | 0.513 | 0.551 | 0.619 |
| 6.063273821428063 | 0.512 | 0.55 | 0.616 |
| 6.066415414081653 | 0.512 | 0.548 | 0.612 |
| 6.069557006735242 | 0.511 | 0.547 | 0.609 |
| 6.072698599388831 | 0.511 | 0.546 | 0.606 |
| 6.07584019204242 | 0.511 | 0.544 | 0.602 |
| 6.078981784696011 | 0.51 | 0.543 | 0.599 |
| 6.082123377349601 | 0.51 | 0.541 | 0.596 |
| 6.08526497000319 | 0.51 | 0.54 | 0.593 |
| 6.08840656265678 | 0.51 | 0.539 | 0.59 |
| 6.09154815531037 | 0.509 | 0.538 | 0.587 |
| 6.094689747963959 | 0.509 | 0.536 | 0.584 |
| 6.097831340617549 | 0.509 | 0.535 | 0.581 |
| 6.100972933271138 | 0.508 | 0.534 | 0.578 |
| 6.104114525924728 | 0.508 | 0.533 | 0.575 |
| 6.107256118578317 | 0.508 | 0.532 | 0.573 |
| 6.110397711231907 | 0.508 | 0.53 | 0.57 |
| 6.113539303885497 | 0.507 | 0.529 | 0.567 |
| 6.116680896539086 | 0.507 | 0.528 | 0.565 |
| 6.119822489192675 | 0.507 | 0.527 | 0.562 |
| 6.122964081846265 | 0.506 | 0.526 | 0.56 |
| 6.126105674499855 | 0.506 | 0.525 | 0.557 |
| 6.129247267153445 | 0.506 | 0.524 | 0.555 |
| 6.132388859807034 | 0.506 | 0.523 | 0.553 |
| 6.135530452460624 | 0.505 | 0.522 | 0.551 |
| 6.138672045114213 | 0.505 | 0.521 | 0.548 |
| 6.141813637767803 | 0.505 | 0.52 | 0.546 |
| 6.144955230421393 | 0.505 | 0.519 | 0.544 |
| 6.148096823074982 | 0.505 | 0.518 | 0.542 |
| 6.151238415728571 | 0.504 | 0.518 | 0.54 |
| 6.154380008382161 | 0.504 | 0.517 | 0.538 |
| 6.157521601035751 | 0.504 | 0.516 | 0.536 |
| 6.16066319368934 | 0.504 | 0.515 | 0.535 |
| 6.16380478634293 | 0.504 | 0.514 | 0.533 |
| 6.16694637899652 | 0.503 | 0.514 | 0.531 |
| 6.170087971650109 | 0.503 | 0.513 | 0.529 |
| 6.173229564303698 | 0.503 | 0.512 | 0.528 |
| 6.176371156957289 | 0.503 | 0.511 | 0.526 |
| 6.179512749610878 | 0.503 | 0.511 | 0.525 |
| 6.182654342264468 | 0.503 | 0.51 | 0.523 |
| 6.185795934918057 | 0.502 | 0.51 | 0.522 |
| 6.188937527571647 | 0.502 | 0.509 | 0.52 |
| 6.192079120225237 | 0.502 | 0.508 | 0.519 |
| 6.195220712878826 | 0.502 | 0.508 | 0.518 |
| 6.198362305532415 | 0.502 | 0.507 | 0.516 |
| 6.201503898186005 | 0.502 | 0.507 | 0.515 |
| 6.204645490839594 | 0.502 | 0.506 | 0.514 |
| 6.207787083493184 | 0.501 | 0.506 | 0.513 |
| 6.210928676146774 | 0.501 | 0.505 | 0.512 |
| 6.214070268800364 | 0.501 | 0.505 | 0.511 |
| 6.217211861453953 | 0.501 | 0.504 | 0.51 |
| 6.220353454107543 | 0.501 | 0.504 | 0.509 |
| 6.223495046761133 | 0.501 | 0.504 | 0.508 |
| 6.226636639414722 | 0.501 | 0.503 | 0.507 |
| 6.229778232068312 | 0.501 | 0.503 | 0.506 |
| 6.232919824721901 | 0.501 | 0.503 | 0.506 |
| 6.236061417375491 | 0.501 | 0.502 | 0.505 |
| 6.23920301002908 | 0.5 | 0.502 | 0.504 |
| 6.24234460268267 | 0.5 | 0.502 | 0.504 |
| 6.24548619533626 | 0.5 | 0.501 | 0.503 |
| 6.24862778798985 | 0.5 | 0.501 | 0.503 |
| 6.251769380643438 | 0.5 | 0.501 | 0.502 |
| 6.254910973297028 | 0.5 | 0.501 | 0.502 |
| 6.258052565950618 | 0.5 | 0.501 | 0.501 |
| 6.261194158604208 | 0.5 | 0.5 | 0.501 |
| 6.264335751257797 | 0.5 | 0.5 | 0.501 |
| 6.267477343911387 | 0.5 | 0.5 | 0.501 |
| 6.270618936564976 | 0.5 | 0.5 | 0.5 |
| 6.273760529218566 | 0.5 | 0.5 | 0.5 |
| 6.276902121872155 | 0.5 | 0.5 | 0.5 |
| 6.280043714525745 | 0.5 | 0.5 | 0.5 |
| 6.283185307179335 | 0.5 | 0.5 | 0.5 |